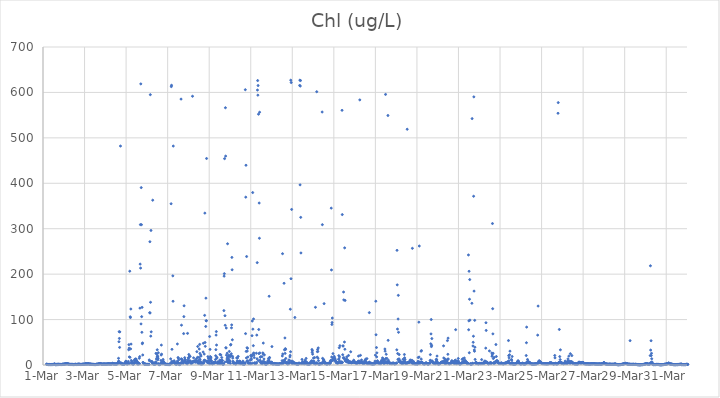
| Category | Chl (ug/L) |
|---|---|
| 44986.166666666664 | 1.69 |
| 44986.177083333336 | 1.74 |
| 44986.1875 | 1.43 |
| 44986.197916666664 | 1.4 |
| 44986.208333333336 | 1.3 |
| 44986.21875 | 1.14 |
| 44986.229166666664 | 1.26 |
| 44986.239583333336 | 1.11 |
| 44986.25 | 1.04 |
| 44986.260416666664 | 0.96 |
| 44986.270833333336 | 1.03 |
| 44986.28125 | 1.1 |
| 44986.291666666664 | 1.08 |
| 44986.302083333336 | 1.08 |
| 44986.3125 | 1.01 |
| 44986.322916666664 | 1.13 |
| 44986.333333333336 | 0.9 |
| 44986.34375 | 0.86 |
| 44986.354166666664 | 1.02 |
| 44986.364583333336 | 0.99 |
| 44986.375 | 0.85 |
| 44986.385416666664 | 0.95 |
| 44986.395833333336 | 1.22 |
| 44986.40625 | 1.03 |
| 44986.416666666664 | 0.92 |
| 44986.427083333336 | 1.09 |
| 44986.4375 | 1.03 |
| 44986.447916666664 | 0.97 |
| 44986.458333333336 | 1.02 |
| 44986.46875 | 1.23 |
| 44986.479166666664 | 1.21 |
| 44986.489583333336 | 0.96 |
| 44986.5 | 1.18 |
| 44986.510416666664 | 1.37 |
| 44986.520833333336 | 1.61 |
| 44986.53125 | 1.49 |
| 44986.541666666664 | 1.84 |
| 44986.552083333336 | 1.69 |
| 44986.5625 | 2.09 |
| 44986.572916666664 | 2.31 |
| 44986.583333333336 | 0.99 |
| 44986.59375 | 0.76 |
| 44986.604166666664 | 0.89 |
| 44986.614583333336 | 0.94 |
| 44986.625 | 0.81 |
| 44986.635416666664 | 0.73 |
| 44986.645833333336 | 0.79 |
| 44986.65625 | 1.16 |
| 44986.666666666664 | 1.66 |
| 44986.677083333336 | 0.84 |
| 44986.6875 | 0.89 |
| 44986.697916666664 | 0.98 |
| 44986.708333333336 | 1.47 |
| 44986.71875 | 1.92 |
| 44986.729166666664 | 1.52 |
| 44986.739583333336 | 1.25 |
| 44986.75 | 1.54 |
| 44986.760416666664 | 0.78 |
| 44986.770833333336 | 1.34 |
| 44986.78125 | 1.43 |
| 44986.791666666664 | 1.22 |
| 44986.802083333336 | 1.22 |
| 44986.8125 | 1.21 |
| 44986.822916666664 | 1.11 |
| 44986.833333333336 | 1.24 |
| 44986.84375 | 1.16 |
| 44986.854166666664 | 1.22 |
| 44986.864583333336 | 0.91 |
| 44986.875 | 1.33 |
| 44986.885416666664 | 1.12 |
| 44986.895833333336 | 1.16 |
| 44986.90625 | 0.96 |
| 44986.916666666664 | 1.14 |
| 44986.927083333336 | 1.21 |
| 44986.9375 | 1.52 |
| 44986.947916666664 | 1.69 |
| 44986.958333333336 | 1.68 |
| 44986.96875 | 1.69 |
| 44986.979166666664 | 1.68 |
| 44986.989583333336 | 1.74 |
| 44987.0 | 1.65 |
| 44987.010416666664 | 1.67 |
| 44987.020833333336 | 1.86 |
| 44987.03125 | 1.88 |
| 44987.041666666664 | 2.1 |
| 44987.052083333336 | 2.05 |
| 44987.0625 | 2.29 |
| 44987.072916666664 | 2.43 |
| 44987.083333333336 | 2.35 |
| 44987.09375 | 2.41 |
| 44987.104166666664 | 2.98 |
| 44987.114583333336 | 2.79 |
| 44987.125 | 2.88 |
| 44987.135416666664 | 2.73 |
| 44987.145833333336 | 2.21 |
| 44987.15625 | 2.87 |
| 44987.166666666664 | 2.99 |
| 44987.177083333336 | 2.99 |
| 44987.1875 | 2.67 |
| 44987.197916666664 | 2.53 |
| 44987.208333333336 | 2.46 |
| 44987.21875 | 1.86 |
| 44987.229166666664 | 1.7 |
| 44987.239583333336 | 1.77 |
| 44987.25 | 1.62 |
| 44987.260416666664 | 1.53 |
| 44987.270833333336 | 1.51 |
| 44987.28125 | 1.38 |
| 44987.291666666664 | 1.34 |
| 44987.302083333336 | 1.28 |
| 44987.3125 | 1.28 |
| 44987.322916666664 | 1.35 |
| 44987.333333333336 | 1.04 |
| 44987.34375 | 1.37 |
| 44987.354166666664 | 1.25 |
| 44987.364583333336 | 1.32 |
| 44987.375 | 1.31 |
| 44987.385416666664 | 1.2 |
| 44987.395833333336 | 1.33 |
| 44987.40625 | 1.01 |
| 44987.416666666664 | 1.22 |
| 44987.427083333336 | 1.42 |
| 44987.4375 | 1.06 |
| 44987.447916666664 | 1.08 |
| 44987.458333333336 | 1.06 |
| 44987.46875 | 0.98 |
| 44987.479166666664 | 1.07 |
| 44987.489583333336 | 1.11 |
| 44987.5 | 1.04 |
| 44987.510416666664 | 1.04 |
| 44987.520833333336 | 1.27 |
| 44987.53125 | 1.28 |
| 44987.541666666664 | 1.17 |
| 44987.552083333336 | 1.35 |
| 44987.5625 | 1.62 |
| 44987.572916666664 | 1.47 |
| 44987.583333333336 | 1.05 |
| 44987.59375 | 1.29 |
| 44987.604166666664 | 1.18 |
| 44987.614583333336 | 1.15 |
| 44987.625 | 1.04 |
| 44987.635416666664 | 1.19 |
| 44987.645833333336 | 1.63 |
| 44987.65625 | 1.56 |
| 44987.666666666664 | 1.22 |
| 44987.677083333336 | 1.07 |
| 44987.6875 | 1.19 |
| 44987.697916666664 | 1.73 |
| 44987.708333333336 | 1.73 |
| 44987.71875 | 1.62 |
| 44987.729166666664 | 1.6 |
| 44987.739583333336 | 1.73 |
| 44987.75 | 1.64 |
| 44987.760416666664 | 1.49 |
| 44987.770833333336 | 1.48 |
| 44987.78125 | 1.33 |
| 44987.791666666664 | 1.32 |
| 44987.802083333336 | 1.31 |
| 44987.8125 | 1.14 |
| 44987.822916666664 | 1.08 |
| 44987.833333333336 | 1.36 |
| 44987.84375 | 1.44 |
| 44987.854166666664 | 1.1 |
| 44987.864583333336 | 1.24 |
| 44987.875 | 1.45 |
| 44987.885416666664 | 1.43 |
| 44987.895833333336 | 1.51 |
| 44987.90625 | 1.67 |
| 44987.916666666664 | 1.6 |
| 44987.927083333336 | 1.43 |
| 44987.9375 | 1.62 |
| 44987.947916666664 | 1.79 |
| 44987.958333333336 | 1.98 |
| 44987.96875 | 1.55 |
| 44987.979166666664 | 1.65 |
| 44987.989583333336 | 1.64 |
| 44988.0 | 1.68 |
| 44988.010416666664 | 1.64 |
| 44988.020833333336 | 1.93 |
| 44988.03125 | 1.88 |
| 44988.041666666664 | 1.9 |
| 44988.052083333336 | 3.37 |
| 44988.0625 | 2.58 |
| 44988.072916666664 | 2.38 |
| 44988.083333333336 | 2.58 |
| 44988.09375 | 2.08 |
| 44988.104166666664 | 2.17 |
| 44988.114583333336 | 2.05 |
| 44988.125 | 2.23 |
| 44988.135416666664 | 2.37 |
| 44988.145833333336 | 2.31 |
| 44988.15625 | 2.35 |
| 44988.166666666664 | 2.82 |
| 44988.177083333336 | 2.87 |
| 44988.1875 | 3 |
| 44988.197916666664 | 2.35 |
| 44988.208333333336 | 2.21 |
| 44988.21875 | 2.03 |
| 44988.229166666664 | 1.95 |
| 44988.239583333336 | 1.89 |
| 44988.25 | 1.74 |
| 44988.260416666664 | 1.92 |
| 44988.270833333336 | 1.85 |
| 44988.28125 | 1.94 |
| 44988.291666666664 | 1.73 |
| 44988.302083333336 | 1.85 |
| 44988.3125 | 1.72 |
| 44988.322916666664 | 1.67 |
| 44988.333333333336 | 1.5 |
| 44988.34375 | 1.31 |
| 44988.354166666664 | 1.41 |
| 44988.364583333336 | 1.36 |
| 44988.375 | 1.42 |
| 44988.385416666664 | 1.41 |
| 44988.395833333336 | 1.31 |
| 44988.40625 | 1.45 |
| 44988.416666666664 | 1.28 |
| 44988.427083333336 | 1.47 |
| 44988.4375 | 1.11 |
| 44988.447916666664 | 1.07 |
| 44988.458333333336 | 1.08 |
| 44988.46875 | 0.98 |
| 44988.479166666664 | 1.2 |
| 44988.489583333336 | 1.09 |
| 44988.5 | 0.99 |
| 44988.510416666664 | 0.99 |
| 44988.520833333336 | 1.07 |
| 44988.53125 | 0.94 |
| 44988.541666666664 | 1.34 |
| 44988.552083333336 | 1.37 |
| 44988.5625 | 1.19 |
| 44988.572916666664 | 2.05 |
| 44988.583333333336 | 1.29 |
| 44988.59375 | 1.45 |
| 44988.604166666664 | 1.46 |
| 44988.614583333336 | 1.59 |
| 44988.625 | 1.62 |
| 44988.635416666664 | 1.78 |
| 44988.645833333336 | 1.84 |
| 44988.65625 | 1.96 |
| 44988.666666666664 | 2.11 |
| 44988.677083333336 | 2.39 |
| 44988.6875 | 2.29 |
| 44988.697916666664 | 2.4 |
| 44988.708333333336 | 2.47 |
| 44988.71875 | 2.56 |
| 44988.729166666664 | 2.76 |
| 44988.739583333336 | 2.9 |
| 44988.75 | 3.07 |
| 44988.760416666664 | 3.21 |
| 44988.770833333336 | 2.92 |
| 44988.78125 | 2.64 |
| 44988.791666666664 | 2.51 |
| 44988.802083333336 | 2.16 |
| 44988.8125 | 2.04 |
| 44988.822916666664 | 1.79 |
| 44988.833333333336 | 1.73 |
| 44988.84375 | 1.84 |
| 44988.854166666664 | 1.8 |
| 44988.864583333336 | 1.82 |
| 44988.875 | 1.65 |
| 44988.885416666664 | 1.98 |
| 44988.895833333336 | 1.95 |
| 44988.90625 | 2 |
| 44988.916666666664 | 2.03 |
| 44988.927083333336 | 2 |
| 44988.9375 | 2.12 |
| 44988.947916666664 | 2.05 |
| 44988.958333333336 | 2.09 |
| 44988.96875 | 2 |
| 44988.979166666664 | 2.04 |
| 44988.989583333336 | 1.9 |
| 44989.0 | 1.86 |
| 44989.010416666664 | 1.79 |
| 44989.020833333336 | 1.83 |
| 44989.03125 | 1.89 |
| 44989.041666666664 | 1.82 |
| 44989.052083333336 | 2.05 |
| 44989.0625 | 1.83 |
| 44989.072916666664 | 2.15 |
| 44989.083333333336 | 2.12 |
| 44989.09375 | 2.08 |
| 44989.104166666664 | 2.09 |
| 44989.114583333336 | 2.28 |
| 44989.125 | 2.57 |
| 44989.135416666664 | 2.38 |
| 44989.145833333336 | 2.43 |
| 44989.15625 | 2.37 |
| 44989.166666666664 | 2.8 |
| 44989.177083333336 | 2.42 |
| 44989.1875 | 2.4 |
| 44989.197916666664 | 2.19 |
| 44989.208333333336 | 2.18 |
| 44989.21875 | 2.04 |
| 44989.229166666664 | 2.51 |
| 44989.239583333336 | 2.3 |
| 44989.25 | 2.06 |
| 44989.260416666664 | 2.03 |
| 44989.270833333336 | 2.29 |
| 44989.28125 | 2.21 |
| 44989.291666666664 | 2.12 |
| 44989.302083333336 | 1.97 |
| 44989.3125 | 2.24 |
| 44989.322916666664 | 2.6 |
| 44989.333333333336 | 2.84 |
| 44989.34375 | 3.01 |
| 44989.354166666664 | 3.96 |
| 44989.364583333336 | 3.27 |
| 44989.375 | 2.56 |
| 44989.385416666664 | 2.48 |
| 44989.395833333336 | 2.4 |
| 44989.40625 | 2.72 |
| 44989.416666666664 | 2.22 |
| 44989.427083333336 | 2.34 |
| 44989.4375 | 2.39 |
| 44989.447916666664 | 2.51 |
| 44989.458333333336 | 2.31 |
| 44989.46875 | 2.14 |
| 44989.479166666664 | 2.08 |
| 44989.489583333336 | 2.13 |
| 44989.5 | 1.93 |
| 44989.510416666664 | 2.38 |
| 44989.520833333336 | 2.22 |
| 44989.53125 | 2.32 |
| 44989.541666666664 | 2.17 |
| 44989.552083333336 | 2.02 |
| 44989.5625 | 1.88 |
| 44989.572916666664 | 3.08 |
| 44989.583333333336 | 3.71 |
| 44989.59375 | 3.32 |
| 44989.604166666664 | 4.38 |
| 44989.614583333336 | 5.33 |
| 44989.625 | 6.44 |
| 44989.635416666664 | 14.7 |
| 44989.645833333336 | 8.84 |
| 44989.65625 | 51.25 |
| 44989.666666666664 | 73.38 |
| 44989.677083333336 | 58.46 |
| 44989.6875 | 38.7 |
| 44989.697916666664 | 72.84 |
| 44989.708333333336 | 3.96 |
| 44989.71875 | 3.85 |
| 44989.729166666664 | 481.94 |
| 44989.739583333336 | 4.78 |
| 44989.75 | 4.23 |
| 44989.760416666664 | 4.21 |
| 44989.770833333336 | 2.77 |
| 44989.78125 | 2.9 |
| 44989.791666666664 | 2.41 |
| 44989.802083333336 | 3.04 |
| 44989.8125 | 2.02 |
| 44989.822916666664 | 1.99 |
| 44989.833333333336 | 1.93 |
| 44989.84375 | 1.79 |
| 44989.854166666664 | 1.78 |
| 44989.864583333336 | 1.88 |
| 44989.875 | 1.69 |
| 44989.885416666664 | 1.62 |
| 44989.895833333336 | 1.79 |
| 44989.90625 | 1.9 |
| 44989.916666666664 | 1.84 |
| 44989.927083333336 | 2.4 |
| 44989.9375 | 3.34 |
| 44989.947916666664 | 3.91 |
| 44989.958333333336 | 3.68 |
| 44989.96875 | 5.8 |
| 44989.979166666664 | 7.62 |
| 44989.989583333336 | 8.38 |
| 44990.0 | 2.61 |
| 44990.010416666664 | 5.73 |
| 44990.020833333336 | 2.99 |
| 44990.03125 | 2.55 |
| 44990.041666666664 | 3.24 |
| 44990.052083333336 | 2.66 |
| 44990.0625 | 2.6 |
| 44990.072916666664 | 2.28 |
| 44990.083333333336 | 3.01 |
| 44990.09375 | 3.7 |
| 44990.104166666664 | 7.79 |
| 44990.114583333336 | 3.16 |
| 44990.125 | 33.53 |
| 44990.135416666664 | 44.79 |
| 44990.145833333336 | 37.09 |
| 44990.15625 | 17.83 |
| 44990.166666666664 | 3.25 |
| 44990.177083333336 | 206.48 |
| 44990.1875 | 16.83 |
| 44990.197916666664 | 106.09 |
| 44990.208333333336 | 104.43 |
| 44990.21875 | 35.45 |
| 44990.229166666664 | 123.23 |
| 44990.239583333336 | 46.03 |
| 44990.25 | 10.05 |
| 44990.260416666664 | 5.6 |
| 44990.270833333336 | 4.89 |
| 44990.28125 | 7.2 |
| 44990.291666666664 | 3.55 |
| 44990.302083333336 | 6.2 |
| 44990.3125 | 3.52 |
| 44990.322916666664 | 2.05 |
| 44990.333333333336 | 1.77 |
| 44990.34375 | 2.04 |
| 44990.354166666664 | 1.88 |
| 44990.364583333336 | 3.31 |
| 44990.375 | 3.33 |
| 44990.385416666664 | 10.06 |
| 44990.395833333336 | 4.83 |
| 44990.40625 | 5.02 |
| 44990.416666666664 | 4.84 |
| 44990.427083333336 | 12.58 |
| 44990.4375 | 9.54 |
| 44990.447916666664 | 9.62 |
| 44990.458333333336 | 13.48 |
| 44990.46875 | 11.82 |
| 44990.479166666664 | 12.86 |
| 44990.489583333336 | 9.41 |
| 44990.5 | 9.17 |
| 44990.510416666664 | 7.58 |
| 44990.520833333336 | 7.54 |
| 44990.53125 | 7.17 |
| 44990.541666666664 | 6.37 |
| 44990.552083333336 | 2.01 |
| 44990.5625 | 3 |
| 44990.572916666664 | 3.55 |
| 44990.583333333336 | 2.92 |
| 44990.59375 | 2.01 |
| 44990.604166666664 | 3.56 |
| 44990.614583333336 | 2.87 |
| 44990.625 | 2.89 |
| 44990.635416666664 | 14.85 |
| 44990.645833333336 | 2.95 |
| 44990.65625 | 18.49 |
| 44990.666666666664 | 125.18 |
| 44990.677083333336 | 222.08 |
| 44990.6875 | 309.01 |
| 44990.697916666664 | 213.34 |
| 44990.708333333336 | 618.78 |
| 44990.71875 | 90.41 |
| 44990.729166666664 | 390.46 |
| 44990.739583333336 | 308.9 |
| 44990.75 | 106.39 |
| 44990.760416666664 | 71.98 |
| 44990.770833333336 | 126.9 |
| 44990.78125 | 46.82 |
| 44990.791666666664 | 48.6 |
| 44990.802083333336 | 22.08 |
| 44990.8125 | 5.78 |
| 44990.822916666664 | 4.71 |
| 44990.833333333336 | 4.82 |
| 44990.84375 | 3.48 |
| 44990.854166666664 | 3.35 |
| 44990.864583333336 | 2.79 |
| 44990.875 | 2.03 |
| 44990.885416666664 | 1.52 |
| 44990.895833333336 | 1.9 |
| 44990.90625 | 2.65 |
| 44990.916666666664 | 1.52 |
| 44990.927083333336 | 1.7 |
| 44990.9375 | 1.55 |
| 44990.947916666664 | 1.54 |
| 44990.958333333336 | 1.37 |
| 44990.96875 | 1.26 |
| 44990.979166666664 | 1.25 |
| 44990.989583333336 | 1.18 |
| 44991.0 | 1.48 |
| 44991.010416666664 | 1.15 |
| 44991.020833333336 | 1.33 |
| 44991.03125 | 1.26 |
| 44991.041666666664 | 1.26 |
| 44991.052083333336 | 1.46 |
| 44991.0625 | 1.32 |
| 44991.072916666664 | 1.22 |
| 44991.083333333336 | 1.12 |
| 44991.09375 | 1.4 |
| 44991.104166666664 | 1.4 |
| 44991.114583333336 | 11.15 |
| 44991.125 | 9.31 |
| 44991.135416666664 | 115.13 |
| 44991.145833333336 | 271.39 |
| 44991.15625 | 114.54 |
| 44991.166666666664 | 595.06 |
| 44991.177083333336 | 138.02 |
| 44991.1875 | 63.56 |
| 44991.197916666664 | 296.2 |
| 44991.208333333336 | 73.01 |
| 44991.21875 | 7.69 |
| 44991.229166666664 | 6.73 |
| 44991.239583333336 | 6.89 |
| 44991.25 | 7.01 |
| 44991.260416666664 | 6.5 |
| 44991.270833333336 | 3.22 |
| 44991.28125 | 362.8 |
| 44991.291666666664 | 2.77 |
| 44991.302083333336 | 2.77 |
| 44991.3125 | 2.64 |
| 44991.322916666664 | 2.6 |
| 44991.333333333336 | 2.27 |
| 44991.34375 | 2.18 |
| 44991.354166666664 | 1.91 |
| 44991.364583333336 | 1.54 |
| 44991.375 | 4.45 |
| 44991.385416666664 | 2.14 |
| 44991.395833333336 | 1.38 |
| 44991.40625 | 2.61 |
| 44991.416666666664 | 4.9 |
| 44991.427083333336 | 6.69 |
| 44991.4375 | 25.63 |
| 44991.447916666664 | 4.51 |
| 44991.458333333336 | 13.2 |
| 44991.46875 | 3.34 |
| 44991.479166666664 | 24.28 |
| 44991.489583333336 | 17.55 |
| 44991.5 | 33.47 |
| 44991.510416666664 | 19.85 |
| 44991.520833333336 | 11.34 |
| 44991.53125 | 17.69 |
| 44991.541666666664 | 13.88 |
| 44991.552083333336 | 26.83 |
| 44991.5625 | 3 |
| 44991.572916666664 | 0.95 |
| 44991.583333333336 | 0.84 |
| 44991.59375 | 0.96 |
| 44991.604166666664 | 0.97 |
| 44991.614583333336 | 0.94 |
| 44991.625 | 0.97 |
| 44991.635416666664 | 2.05 |
| 44991.645833333336 | 2.79 |
| 44991.65625 | 2.38 |
| 44991.666666666664 | 3.08 |
| 44991.677083333336 | 9.9 |
| 44991.6875 | 21.99 |
| 44991.697916666664 | 43.86 |
| 44991.708333333336 | 23.88 |
| 44991.71875 | 4.63 |
| 44991.729166666664 | 3.62 |
| 44991.739583333336 | 7.26 |
| 44991.75 | 6.08 |
| 44991.760416666664 | 3.13 |
| 44991.770833333336 | 3.39 |
| 44991.78125 | 12.2 |
| 44991.791666666664 | 7.46 |
| 44991.802083333336 | 7.74 |
| 44991.8125 | 4.07 |
| 44991.822916666664 | 4.5 |
| 44991.833333333336 | 3.56 |
| 44991.84375 | 3.21 |
| 44991.854166666664 | 2.36 |
| 44991.864583333336 | 2.81 |
| 44991.875 | 2.43 |
| 44991.885416666664 | 2 |
| 44991.895833333336 | 1.7 |
| 44991.90625 | 1.76 |
| 44991.916666666664 | 1.5 |
| 44991.927083333336 | 1.52 |
| 44991.9375 | 1.42 |
| 44991.947916666664 | 1.35 |
| 44991.958333333336 | 1.25 |
| 44991.96875 | 1.37 |
| 44991.979166666664 | 1.38 |
| 44991.989583333336 | 1.19 |
| 44992.0 | 1.16 |
| 44992.010416666664 | 1.04 |
| 44992.020833333336 | 1.17 |
| 44992.03125 | 1.24 |
| 44992.041666666664 | 1.12 |
| 44992.052083333336 | 0.98 |
| 44992.0625 | 0.86 |
| 44992.072916666664 | 0.75 |
| 44992.083333333336 | 1.27 |
| 44992.09375 | 1.02 |
| 44992.104166666664 | 1.14 |
| 44992.114583333336 | 1.87 |
| 44992.125 | 3.51 |
| 44992.135416666664 | 2.13 |
| 44992.145833333336 | 13.52 |
| 44992.15625 | 2.76 |
| 44992.166666666664 | 354.96 |
| 44992.177083333336 | 612.76 |
| 44992.1875 | 615.73 |
| 44992.197916666664 | 7.99 |
| 44992.208333333336 | 34.51 |
| 44992.21875 | 5.36 |
| 44992.229166666664 | 4.43 |
| 44992.239583333336 | 6.67 |
| 44992.25 | 196.22 |
| 44992.260416666664 | 140.31 |
| 44992.270833333336 | 481.93 |
| 44992.28125 | 6.77 |
| 44992.291666666664 | 6.75 |
| 44992.302083333336 | 6.55 |
| 44992.3125 | 9.36 |
| 44992.322916666664 | 6.43 |
| 44992.333333333336 | 5.73 |
| 44992.34375 | 4.31 |
| 44992.354166666664 | 3.68 |
| 44992.364583333336 | 2.99 |
| 44992.375 | 2.53 |
| 44992.385416666664 | 3.04 |
| 44992.395833333336 | 2.1 |
| 44992.40625 | 1.7 |
| 44992.416666666664 | 1.85 |
| 44992.427083333336 | 1.63 |
| 44992.4375 | 3.94 |
| 44992.447916666664 | 1.79 |
| 44992.458333333336 | 8 |
| 44992.46875 | 46.27 |
| 44992.479166666664 | 4.7 |
| 44992.489583333336 | 5.35 |
| 44992.5 | 16.36 |
| 44992.510416666664 | 4.99 |
| 44992.520833333336 | 14.95 |
| 44992.53125 | 11.15 |
| 44992.541666666664 | 3 |
| 44992.552083333336 | 1.08 |
| 44992.5625 | 1.19 |
| 44992.572916666664 | 0.98 |
| 44992.583333333336 | 0.93 |
| 44992.59375 | 1.58 |
| 44992.604166666664 | 2.08 |
| 44992.614583333336 | 3.61 |
| 44992.625 | 3.44 |
| 44992.635416666664 | 4.39 |
| 44992.645833333336 | 585.32 |
| 44992.65625 | 13.55 |
| 44992.666666666664 | 87.69 |
| 44992.677083333336 | 11.54 |
| 44992.6875 | 12.86 |
| 44992.697916666664 | 6.55 |
| 44992.708333333336 | 9.32 |
| 44992.71875 | 4.51 |
| 44992.729166666664 | 5.33 |
| 44992.739583333336 | 5.88 |
| 44992.75 | 3.93 |
| 44992.760416666664 | 4.92 |
| 44992.770833333336 | 69.12 |
| 44992.78125 | 106.53 |
| 44992.791666666664 | 130.3 |
| 44992.802083333336 | 7.19 |
| 44992.8125 | 9.96 |
| 44992.822916666664 | 16.14 |
| 44992.833333333336 | 12.38 |
| 44992.84375 | 10.66 |
| 44992.854166666664 | 10.94 |
| 44992.864583333336 | 6.71 |
| 44992.875 | 6.01 |
| 44992.885416666664 | 5.71 |
| 44992.895833333336 | 4.74 |
| 44992.90625 | 3.76 |
| 44992.916666666664 | 3.18 |
| 44992.927083333336 | 2.95 |
| 44992.9375 | 2.79 |
| 44992.947916666664 | 2.69 |
| 44992.958333333336 | 69.61 |
| 44992.96875 | 7.68 |
| 44992.979166666664 | 11.15 |
| 44992.989583333336 | 5.77 |
| 44993.0 | 15.53 |
| 44993.010416666664 | 15.67 |
| 44993.020833333336 | 23.15 |
| 44993.03125 | 7.32 |
| 44993.041666666664 | 19.53 |
| 44993.052083333336 | 8.75 |
| 44993.0625 | 8.77 |
| 44993.072916666664 | 7.21 |
| 44993.083333333336 | 18.94 |
| 44993.09375 | 8.91 |
| 44993.104166666664 | 4.9 |
| 44993.114583333336 | 4.41 |
| 44993.125 | 4.06 |
| 44993.135416666664 | 5.4 |
| 44993.145833333336 | 3.52 |
| 44993.15625 | 6.26 |
| 44993.166666666664 | 3.94 |
| 44993.177083333336 | 5.64 |
| 44993.1875 | 5.32 |
| 44993.197916666664 | 591.57 |
| 44993.208333333336 | 6.25 |
| 44993.21875 | 6.86 |
| 44993.229166666664 | 8.18 |
| 44993.239583333336 | 7.14 |
| 44993.25 | 15.74 |
| 44993.260416666664 | 7.27 |
| 44993.270833333336 | 7.84 |
| 44993.28125 | 6.87 |
| 44993.291666666664 | 8.15 |
| 44993.302083333336 | 9.16 |
| 44993.3125 | 7.76 |
| 44993.322916666664 | 8.94 |
| 44993.333333333336 | 9.23 |
| 44993.34375 | 6.11 |
| 44993.354166666664 | 7.96 |
| 44993.364583333336 | 7.13 |
| 44993.375 | 7.4 |
| 44993.385416666664 | 13.61 |
| 44993.395833333336 | 9 |
| 44993.40625 | 29.33 |
| 44993.416666666664 | 8.38 |
| 44993.427083333336 | 6.02 |
| 44993.4375 | 16.87 |
| 44993.447916666664 | 40.8 |
| 44993.458333333336 | 6.79 |
| 44993.46875 | 3.62 |
| 44993.479166666664 | 4.54 |
| 44993.489583333336 | 10.3 |
| 44993.5 | 3.23 |
| 44993.510416666664 | 16.68 |
| 44993.520833333336 | 35.16 |
| 44993.53125 | 6.46 |
| 44993.541666666664 | 45.37 |
| 44993.552083333336 | 25.39 |
| 44993.5625 | 12.4 |
| 44993.572916666664 | 1.99 |
| 44993.583333333336 | 7.51 |
| 44993.59375 | 21.81 |
| 44993.604166666664 | 19.57 |
| 44993.614583333336 | 4.21 |
| 44993.625 | 3.53 |
| 44993.635416666664 | 1.75 |
| 44993.645833333336 | 3.43 |
| 44993.65625 | 4.35 |
| 44993.666666666664 | 2.3 |
| 44993.677083333336 | 3.3 |
| 44993.6875 | 3.32 |
| 44993.697916666664 | 4.31 |
| 44993.708333333336 | 28.6 |
| 44993.71875 | 47.78 |
| 44993.729166666664 | 6.34 |
| 44993.739583333336 | 4.39 |
| 44993.75 | 9.68 |
| 44993.760416666664 | 24.09 |
| 44993.770833333336 | 10.61 |
| 44993.78125 | 109.27 |
| 44993.791666666664 | 334.34 |
| 44993.802083333336 | 49.54 |
| 44993.8125 | 41.08 |
| 44993.822916666664 | 9.63 |
| 44993.833333333336 | 84.85 |
| 44993.84375 | 147.17 |
| 44993.854166666664 | 97.48 |
| 44993.864583333336 | 97.35 |
| 44993.875 | 454.58 |
| 44993.885416666664 | 7.46 |
| 44993.895833333336 | 6.8 |
| 44993.90625 | 6.09 |
| 44993.916666666664 | 9.05 |
| 44993.927083333336 | 5.45 |
| 44993.9375 | 18.37 |
| 44993.947916666664 | 5.61 |
| 44993.958333333336 | 7.15 |
| 44993.96875 | 14.73 |
| 44993.979166666664 | 4.28 |
| 44993.989583333336 | 14.25 |
| 44994.0 | 4.51 |
| 44994.010416666664 | 9.18 |
| 44994.020833333336 | 62.72 |
| 44994.03125 | 2.5 |
| 44994.041666666664 | 34.36 |
| 44994.052083333336 | 18.53 |
| 44994.0625 | 9.3 |
| 44994.072916666664 | 14.42 |
| 44994.083333333336 | 17.11 |
| 44994.09375 | 10.01 |
| 44994.104166666664 | 9.13 |
| 44994.114583333336 | 6.48 |
| 44994.125 | 3.4 |
| 44994.135416666664 | 3.39 |
| 44994.145833333336 | 2.63 |
| 44994.15625 | 2.81 |
| 44994.166666666664 | 2.82 |
| 44994.177083333336 | 3.4 |
| 44994.1875 | 3.6 |
| 44994.197916666664 | 3.35 |
| 44994.208333333336 | 4.89 |
| 44994.21875 | 5.6 |
| 44994.229166666664 | 5.5 |
| 44994.239583333336 | 4.28 |
| 44994.25 | 4.06 |
| 44994.260416666664 | 5.36 |
| 44994.270833333336 | 5.78 |
| 44994.28125 | 5.78 |
| 44994.291666666664 | 6.64 |
| 44994.302083333336 | 12.05 |
| 44994.3125 | 20.41 |
| 44994.322916666664 | 33.78 |
| 44994.333333333336 | 65.84 |
| 44994.34375 | 73.59 |
| 44994.354166666664 | 43.94 |
| 44994.364583333336 | 14.88 |
| 44994.375 | 16.79 |
| 44994.385416666664 | 5.04 |
| 44994.395833333336 | 4.15 |
| 44994.40625 | 3.22 |
| 44994.416666666664 | 5.98 |
| 44994.427083333336 | 7.3 |
| 44994.4375 | 5.37 |
| 44994.447916666664 | 4.92 |
| 44994.458333333336 | 6.01 |
| 44994.46875 | 4.57 |
| 44994.479166666664 | 3.16 |
| 44994.489583333336 | 3.62 |
| 44994.5 | 7.33 |
| 44994.510416666664 | 10.76 |
| 44994.520833333336 | 23.36 |
| 44994.53125 | 2.89 |
| 44994.541666666664 | 8.81 |
| 44994.552083333336 | 8.37 |
| 44994.5625 | 22.09 |
| 44994.572916666664 | 9.99 |
| 44994.583333333336 | 7.68 |
| 44994.59375 | 7.81 |
| 44994.604166666664 | 16.38 |
| 44994.614583333336 | 4.11 |
| 44994.625 | 10.35 |
| 44994.635416666664 | 9.61 |
| 44994.645833333336 | 2.18 |
| 44994.65625 | 1.81 |
| 44994.666666666664 | 1.82 |
| 44994.677083333336 | 1.8 |
| 44994.6875 | 1.77 |
| 44994.697916666664 | 1.94 |
| 44994.708333333336 | 119.76 |
| 44994.71875 | 195.58 |
| 44994.729166666664 | 201.06 |
| 44994.739583333336 | 454.23 |
| 44994.75 | 6.37 |
| 44994.760416666664 | 108.53 |
| 44994.770833333336 | 87.39 |
| 44994.78125 | 566.29 |
| 44994.791666666664 | 459.82 |
| 44994.802083333336 | 38.04 |
| 44994.8125 | 37.5 |
| 44994.822916666664 | 81.43 |
| 44994.833333333336 | 21.7 |
| 44994.84375 | 8.28 |
| 44994.854166666664 | 13.14 |
| 44994.864583333336 | 25.95 |
| 44994.875 | 17.05 |
| 44994.885416666664 | 266.88 |
| 44994.895833333336 | 5.79 |
| 44994.90625 | 6.18 |
| 44994.916666666664 | 11.15 |
| 44994.927083333336 | 13.49 |
| 44994.9375 | 19.45 |
| 44994.947916666664 | 21.42 |
| 44994.958333333336 | 4.73 |
| 44994.96875 | 29.89 |
| 44994.979166666664 | 6.32 |
| 44994.989583333336 | 9.68 |
| 44995.0 | 7.66 |
| 44995.010416666664 | 17.9 |
| 44995.020833333336 | 3.62 |
| 44995.03125 | 44.08 |
| 44995.041666666664 | 45.14 |
| 44995.052083333336 | 21.05 |
| 44995.0625 | 24.68 |
| 44995.072916666664 | 81.77 |
| 44995.083333333336 | 88.29 |
| 44995.09375 | 236.83 |
| 44995.104166666664 | 209.6 |
| 44995.114583333336 | 55.47 |
| 44995.125 | 18.9 |
| 44995.135416666664 | 15.12 |
| 44995.145833333336 | 8.08 |
| 44995.15625 | 6.48 |
| 44995.166666666664 | 5.15 |
| 44995.177083333336 | 3.93 |
| 44995.1875 | 3.44 |
| 44995.197916666664 | 4.1 |
| 44995.208333333336 | 3.31 |
| 44995.21875 | 3.74 |
| 44995.229166666664 | 3.95 |
| 44995.239583333336 | 3.13 |
| 44995.25 | 3.59 |
| 44995.260416666664 | 3.73 |
| 44995.270833333336 | 2.12 |
| 44995.28125 | 2.17 |
| 44995.291666666664 | 2.92 |
| 44995.302083333336 | 2.87 |
| 44995.3125 | 4.72 |
| 44995.322916666664 | 15.6 |
| 44995.333333333336 | 4.51 |
| 44995.34375 | 6.29 |
| 44995.354166666664 | 9.16 |
| 44995.364583333336 | 15.47 |
| 44995.375 | 6.43 |
| 44995.385416666664 | 5.65 |
| 44995.395833333336 | 19.02 |
| 44995.40625 | 6.99 |
| 44995.416666666664 | 6.01 |
| 44995.427083333336 | 4.14 |
| 44995.4375 | 4.17 |
| 44995.447916666664 | 5.14 |
| 44995.458333333336 | 7.14 |
| 44995.46875 | 8.61 |
| 44995.479166666664 | 6.43 |
| 44995.489583333336 | 7.26 |
| 44995.5 | 3.46 |
| 44995.510416666664 | 3.03 |
| 44995.520833333336 | 3.02 |
| 44995.53125 | 2.96 |
| 44995.541666666664 | 3.58 |
| 44995.552083333336 | 4.19 |
| 44995.5625 | 3.34 |
| 44995.572916666664 | 3.34 |
| 44995.583333333336 | 4.68 |
| 44995.59375 | 3.26 |
| 44995.604166666664 | 3.9 |
| 44995.614583333336 | 1.75 |
| 44995.625 | 8.5 |
| 44995.635416666664 | 5.78 |
| 44995.645833333336 | 2.11 |
| 44995.65625 | 1.91 |
| 44995.666666666664 | 2.17 |
| 44995.677083333336 | 1.79 |
| 44995.6875 | 1.86 |
| 44995.697916666664 | 1.82 |
| 44995.708333333336 | 2.94 |
| 44995.71875 | 4.62 |
| 44995.729166666664 | 4.3 |
| 44995.739583333336 | 605.98 |
| 44995.75 | 69.08 |
| 44995.760416666664 | 369.47 |
| 44995.770833333336 | 439.71 |
| 44995.78125 | 29.95 |
| 44995.791666666664 | 15.57 |
| 44995.802083333336 | 238.8 |
| 44995.8125 | 8.39 |
| 44995.822916666664 | 38.06 |
| 44995.833333333336 | 30.57 |
| 44995.84375 | 36.64 |
| 44995.854166666664 | 9.42 |
| 44995.864583333336 | 17.65 |
| 44995.875 | 5.89 |
| 44995.885416666664 | 3.72 |
| 44995.895833333336 | 3.9 |
| 44995.90625 | 4.59 |
| 44995.916666666664 | 3.23 |
| 44995.927083333336 | 3.59 |
| 44995.9375 | 3.44 |
| 44995.947916666664 | 3.86 |
| 44995.958333333336 | 3.33 |
| 44995.96875 | 10.59 |
| 44995.979166666664 | 3.73 |
| 44995.989583333336 | 2.97 |
| 44996.0 | 20.84 |
| 44996.010416666664 | 2.69 |
| 44996.020833333336 | 14.22 |
| 44996.03125 | 11.66 |
| 44996.041666666664 | 19.4 |
| 44996.052083333336 | 21.18 |
| 44996.0625 | 64.55 |
| 44996.072916666664 | 96.75 |
| 44996.083333333336 | 4.02 |
| 44996.09375 | 379.57 |
| 44996.104166666664 | 78.93 |
| 44996.114583333336 | 24.47 |
| 44996.125 | 42.56 |
| 44996.135416666664 | 101.37 |
| 44996.145833333336 | 26.5 |
| 44996.15625 | 21.91 |
| 44996.166666666664 | 16.43 |
| 44996.177083333336 | 4.78 |
| 44996.1875 | 3.66 |
| 44996.197916666664 | 3.15 |
| 44996.208333333336 | 3.42 |
| 44996.21875 | 3 |
| 44996.229166666664 | 3.32 |
| 44996.239583333336 | 4.03 |
| 44996.25 | 4.09 |
| 44996.260416666664 | 3.84 |
| 44996.270833333336 | 25.96 |
| 44996.28125 | 5.34 |
| 44996.291666666664 | 65.81 |
| 44996.302083333336 | 13.79 |
| 44996.3125 | 225.31 |
| 44996.322916666664 | 605.23 |
| 44996.333333333336 | 626.11 |
| 44996.34375 | 593.98 |
| 44996.354166666664 | 615.15 |
| 44996.364583333336 | 9.46 |
| 44996.375 | 552.11 |
| 44996.385416666664 | 78.16 |
| 44996.395833333336 | 25.06 |
| 44996.40625 | 356.55 |
| 44996.416666666664 | 278.98 |
| 44996.427083333336 | 556.39 |
| 44996.4375 | 26.69 |
| 44996.447916666664 | 10.39 |
| 44996.458333333336 | 16.97 |
| 44996.46875 | 6.14 |
| 44996.479166666664 | 18.14 |
| 44996.489583333336 | 5.56 |
| 44996.5 | 3.99 |
| 44996.510416666664 | 6.75 |
| 44996.520833333336 | 3.29 |
| 44996.53125 | 3.44 |
| 44996.541666666664 | 18.42 |
| 44996.552083333336 | 2.89 |
| 44996.5625 | 3.17 |
| 44996.572916666664 | 7.52 |
| 44996.583333333336 | 26.61 |
| 44996.59375 | 24.34 |
| 44996.604166666664 | 48.23 |
| 44996.614583333336 | 6.7 |
| 44996.625 | 7 |
| 44996.635416666664 | 13.29 |
| 44996.645833333336 | 6.88 |
| 44996.65625 | 22.23 |
| 44996.666666666664 | 6.1 |
| 44996.677083333336 | 5.56 |
| 44996.6875 | 2.13 |
| 44996.697916666664 | 2.93 |
| 44996.708333333336 | 1.68 |
| 44996.71875 | 1.51 |
| 44996.729166666664 | 1.67 |
| 44996.739583333336 | 1.87 |
| 44996.75 | 1.7 |
| 44996.760416666664 | 1.75 |
| 44996.770833333336 | 2.15 |
| 44996.78125 | 5.5 |
| 44996.791666666664 | 3.44 |
| 44996.802083333336 | 3.38 |
| 44996.8125 | 3.49 |
| 44996.822916666664 | 6.22 |
| 44996.833333333336 | 9.28 |
| 44996.84375 | 8.91 |
| 44996.854166666664 | 14.23 |
| 44996.864583333336 | 7.2 |
| 44996.875 | 11.04 |
| 44996.885416666664 | 151.35 |
| 44996.895833333336 | 15.6 |
| 44996.90625 | 16.55 |
| 44996.916666666664 | 6.86 |
| 44996.927083333336 | 6.08 |
| 44996.9375 | 5.3 |
| 44996.947916666664 | 4.87 |
| 44996.958333333336 | 4.36 |
| 44996.96875 | 6.14 |
| 44996.979166666664 | 3.72 |
| 44996.989583333336 | 4.63 |
| 44997.0 | 4.47 |
| 44997.010416666664 | 6.41 |
| 44997.020833333336 | 40.53 |
| 44997.03125 | 2.86 |
| 44997.041666666664 | 4.14 |
| 44997.052083333336 | 2.38 |
| 44997.0625 | 2.68 |
| 44997.072916666664 | 2.69 |
| 44997.083333333336 | 2.85 |
| 44997.09375 | 2.55 |
| 44997.104166666664 | 2.56 |
| 44997.114583333336 | 3.01 |
| 44997.125 | 2.66 |
| 44997.135416666664 | 2.88 |
| 44997.145833333336 | 3.06 |
| 44997.15625 | 3.44 |
| 44997.166666666664 | 2.4 |
| 44997.177083333336 | 2.62 |
| 44997.1875 | 2.57 |
| 44997.197916666664 | 2.51 |
| 44997.208333333336 | 2.58 |
| 44997.21875 | 2.25 |
| 44997.229166666664 | 2.11 |
| 44997.239583333336 | 2.28 |
| 44997.25 | 2.25 |
| 44997.260416666664 | 2.14 |
| 44997.270833333336 | 1.96 |
| 44997.28125 | 2.21 |
| 44997.291666666664 | 2.01 |
| 44997.302083333336 | 2.16 |
| 44997.3125 | 1.83 |
| 44997.322916666664 | 1.92 |
| 44997.333333333336 | 1.9 |
| 44997.34375 | 1.97 |
| 44997.354166666664 | 2.03 |
| 44997.364583333336 | 2.2 |
| 44997.375 | 2.38 |
| 44997.385416666664 | 2.59 |
| 44997.395833333336 | 2.65 |
| 44997.40625 | 2.97 |
| 44997.416666666664 | 3.5 |
| 44997.427083333336 | 3.1 |
| 44997.4375 | 3.24 |
| 44997.447916666664 | 3.22 |
| 44997.458333333336 | 3.29 |
| 44997.46875 | 3.61 |
| 44997.479166666664 | 3.96 |
| 44997.489583333336 | 2.83 |
| 44997.5 | 3.37 |
| 44997.510416666664 | 9.52 |
| 44997.520833333336 | 19.92 |
| 44997.53125 | 245.04 |
| 44997.541666666664 | 24.29 |
| 44997.552083333336 | 3.8 |
| 44997.5625 | 9.07 |
| 44997.572916666664 | 4.21 |
| 44997.583333333336 | 5.3 |
| 44997.59375 | 9.33 |
| 44997.604166666664 | 179.89 |
| 44997.614583333336 | 8.09 |
| 44997.625 | 33.45 |
| 44997.635416666664 | 10.92 |
| 44997.645833333336 | 59.52 |
| 44997.65625 | 25.49 |
| 44997.666666666664 | 36 |
| 44997.677083333336 | 34.25 |
| 44997.6875 | 14.5 |
| 44997.697916666664 | 5.54 |
| 44997.708333333336 | 5.04 |
| 44997.71875 | 4.3 |
| 44997.729166666664 | 3.94 |
| 44997.739583333336 | 3.71 |
| 44997.75 | 2.92 |
| 44997.760416666664 | 2.65 |
| 44997.770833333336 | 6.07 |
| 44997.78125 | 2.45 |
| 44997.791666666664 | 2.37 |
| 44997.802083333336 | 2.58 |
| 44997.8125 | 4.23 |
| 44997.822916666664 | 4.39 |
| 44997.833333333336 | 10.91 |
| 44997.84375 | 4.22 |
| 44997.854166666664 | 4.67 |
| 44997.864583333336 | 4.75 |
| 44997.875 | 9.72 |
| 44997.885416666664 | 17.83 |
| 44997.895833333336 | 21.08 |
| 44997.90625 | 122.78 |
| 44997.916666666664 | 29.2 |
| 44997.927083333336 | 626.95 |
| 44997.9375 | 189.94 |
| 44997.947916666664 | 621.72 |
| 44997.958333333336 | 8.18 |
| 44997.96875 | 342.43 |
| 44997.979166666664 | 5.51 |
| 44997.989583333336 | 4.02 |
| 44998.0 | 3.14 |
| 44998.010416666664 | 8.14 |
| 44998.020833333336 | 5.69 |
| 44998.03125 | 4.81 |
| 44998.041666666664 | 6.03 |
| 44998.052083333336 | 5.78 |
| 44998.0625 | 4.13 |
| 44998.072916666664 | 4.78 |
| 44998.083333333336 | 4.07 |
| 44998.09375 | 4.1 |
| 44998.104166666664 | 4.02 |
| 44998.114583333336 | 4 |
| 44998.125 | 104.62 |
| 44998.135416666664 | 3.78 |
| 44998.145833333336 | 3.33 |
| 44998.15625 | 3.21 |
| 44998.166666666664 | 3.26 |
| 44998.177083333336 | 3.24 |
| 44998.1875 | 2.29 |
| 44998.197916666664 | 2.3 |
| 44998.208333333336 | 2.33 |
| 44998.21875 | 2.18 |
| 44998.229166666664 | 2.33 |
| 44998.239583333336 | 2.44 |
| 44998.25 | 1.73 |
| 44998.260416666664 | 1.93 |
| 44998.270833333336 | 1.89 |
| 44998.28125 | 1.87 |
| 44998.291666666664 | 2.15 |
| 44998.302083333336 | 2.46 |
| 44998.3125 | 4.08 |
| 44998.322916666664 | 3.6 |
| 44998.333333333336 | 3.24 |
| 44998.34375 | 3.97 |
| 44998.354166666664 | 615.32 |
| 44998.364583333336 | 626.99 |
| 44998.375 | 396.54 |
| 44998.385416666664 | 614.01 |
| 44998.395833333336 | 626.14 |
| 44998.40625 | 324.97 |
| 44998.416666666664 | 246.64 |
| 44998.427083333336 | 3.18 |
| 44998.4375 | 3.29 |
| 44998.447916666664 | 3.53 |
| 44998.458333333336 | 4.64 |
| 44998.46875 | 12.25 |
| 44998.479166666664 | 3.96 |
| 44998.489583333336 | 3.66 |
| 44998.5 | 7.16 |
| 44998.510416666664 | 5.25 |
| 44998.520833333336 | 3.92 |
| 44998.53125 | 3.75 |
| 44998.541666666664 | 3.22 |
| 44998.552083333336 | 3.37 |
| 44998.5625 | 3.14 |
| 44998.572916666664 | 3.16 |
| 44998.583333333336 | 3.13 |
| 44998.59375 | 2.83 |
| 44998.604166666664 | 4.8 |
| 44998.614583333336 | 10.31 |
| 44998.625 | 6.54 |
| 44998.635416666664 | 4.72 |
| 44998.645833333336 | 4.96 |
| 44998.65625 | 6.93 |
| 44998.666666666664 | 14.43 |
| 44998.677083333336 | 3.4 |
| 44998.6875 | 6.46 |
| 44998.697916666664 | 2.01 |
| 44998.708333333336 | 3.6 |
| 44998.71875 | 2.95 |
| 44998.729166666664 | 2.34 |
| 44998.739583333336 | 2.14 |
| 44998.75 | 2.32 |
| 44998.760416666664 | 3.04 |
| 44998.770833333336 | 1.98 |
| 44998.78125 | 2.13 |
| 44998.791666666664 | 2.06 |
| 44998.802083333336 | 2.02 |
| 44998.8125 | 2.14 |
| 44998.822916666664 | 2.09 |
| 44998.833333333336 | 2.31 |
| 44998.84375 | 2.45 |
| 44998.854166666664 | 2.43 |
| 44998.864583333336 | 3.03 |
| 44998.875 | 5.08 |
| 44998.885416666664 | 7.11 |
| 44998.895833333336 | 4.69 |
| 44998.90625 | 4.57 |
| 44998.916666666664 | 5.32 |
| 44998.927083333336 | 5.35 |
| 44998.9375 | 9.52 |
| 44998.947916666664 | 34.01 |
| 44998.958333333336 | 27.83 |
| 44998.96875 | 31.5 |
| 44998.979166666664 | 23.81 |
| 44998.989583333336 | 7.93 |
| 44999.0 | 8 |
| 44999.010416666664 | 4.53 |
| 44999.020833333336 | 15.23 |
| 44999.03125 | 4.48 |
| 44999.041666666664 | 8.43 |
| 44999.052083333336 | 6.08 |
| 44999.0625 | 3.6 |
| 44999.072916666664 | 16.32 |
| 44999.083333333336 | 3.19 |
| 44999.09375 | 2.58 |
| 44999.104166666664 | 2.62 |
| 44999.114583333336 | 126.97 |
| 44999.125 | 2.71 |
| 44999.135416666664 | 2.88 |
| 44999.145833333336 | 4.51 |
| 44999.15625 | 3.79 |
| 44999.166666666664 | 4.37 |
| 44999.177083333336 | 601.59 |
| 44999.1875 | 3.56 |
| 44999.197916666664 | 17.46 |
| 44999.208333333336 | 29.38 |
| 44999.21875 | 34.27 |
| 44999.229166666664 | 29.98 |
| 44999.239583333336 | 14.9 |
| 44999.25 | 37.6 |
| 44999.260416666664 | 9.4 |
| 44999.270833333336 | 2.06 |
| 44999.28125 | 1.85 |
| 44999.291666666664 | 1.89 |
| 44999.302083333336 | 1.95 |
| 44999.3125 | 1.62 |
| 44999.322916666664 | 1.93 |
| 44999.333333333336 | 2.25 |
| 44999.34375 | 2.3 |
| 44999.354166666664 | 3.36 |
| 44999.364583333336 | 3.23 |
| 44999.375 | 3.43 |
| 44999.385416666664 | 3.15 |
| 44999.395833333336 | 3.05 |
| 44999.40625 | 3.18 |
| 44999.416666666664 | 3.03 |
| 44999.427083333336 | 3.84 |
| 44999.4375 | 556.91 |
| 44999.447916666664 | 308.88 |
| 44999.458333333336 | 14.63 |
| 44999.46875 | 4.37 |
| 44999.479166666664 | 7.28 |
| 44999.489583333336 | 6.8 |
| 44999.5 | 12.32 |
| 44999.510416666664 | 11.44 |
| 44999.520833333336 | 9.66 |
| 44999.53125 | 135.09 |
| 44999.541666666664 | 7.26 |
| 44999.552083333336 | 4.66 |
| 44999.5625 | 3.87 |
| 44999.572916666664 | 4.43 |
| 44999.583333333336 | 4.31 |
| 44999.59375 | 4.01 |
| 44999.604166666664 | 5.03 |
| 44999.614583333336 | 2.81 |
| 44999.625 | 3.61 |
| 44999.635416666664 | 2.2 |
| 44999.645833333336 | 2.26 |
| 44999.65625 | 2.54 |
| 44999.666666666664 | 2.35 |
| 44999.677083333336 | 2.65 |
| 44999.6875 | 2.13 |
| 44999.697916666664 | 2.56 |
| 44999.708333333336 | 3.32 |
| 44999.71875 | 3.07 |
| 44999.729166666664 | 3.62 |
| 44999.739583333336 | 3.76 |
| 44999.75 | 3.04 |
| 44999.760416666664 | 3.48 |
| 44999.770833333336 | 3.25 |
| 44999.78125 | 2.69 |
| 44999.791666666664 | 2.51 |
| 44999.802083333336 | 3.49 |
| 44999.8125 | 3.01 |
| 44999.822916666664 | 3.94 |
| 44999.833333333336 | 6.62 |
| 44999.84375 | 9.44 |
| 44999.854166666664 | 6.96 |
| 44999.864583333336 | 10.6 |
| 44999.875 | 345.32 |
| 44999.885416666664 | 209.18 |
| 44999.895833333336 | 17.53 |
| 44999.90625 | 89.2 |
| 44999.916666666664 | 93.45 |
| 44999.927083333336 | 103.36 |
| 44999.9375 | 9.89 |
| 44999.947916666664 | 11.29 |
| 44999.958333333336 | 25.07 |
| 44999.96875 | 14.79 |
| 44999.979166666664 | 14.47 |
| 44999.989583333336 | 11.21 |
| 45000.0 | 14.42 |
| 45000.010416666664 | 14.91 |
| 45000.020833333336 | 19 |
| 45000.03125 | 12.58 |
| 45000.041666666664 | 12.7 |
| 45000.052083333336 | 14.72 |
| 45000.0625 | 11.18 |
| 45000.072916666664 | 9.17 |
| 45000.083333333336 | 9.56 |
| 45000.09375 | 8.4 |
| 45000.104166666664 | 6.64 |
| 45000.114583333336 | 5.54 |
| 45000.125 | 5.35 |
| 45000.135416666664 | 6.04 |
| 45000.145833333336 | 5.68 |
| 45000.15625 | 3.92 |
| 45000.166666666664 | 4.03 |
| 45000.177083333336 | 4.71 |
| 45000.1875 | 4.75 |
| 45000.197916666664 | 5.1 |
| 45000.208333333336 | 4.51 |
| 45000.21875 | 4.87 |
| 45000.229166666664 | 12.36 |
| 45000.239583333336 | 20.58 |
| 45000.25 | 13.43 |
| 45000.260416666664 | 38.1 |
| 45000.270833333336 | 17.92 |
| 45000.28125 | 8.24 |
| 45000.291666666664 | 42.51 |
| 45000.302083333336 | 5.94 |
| 45000.3125 | 5.13 |
| 45000.322916666664 | 5.42 |
| 45000.333333333336 | 5.38 |
| 45000.34375 | 5.65 |
| 45000.354166666664 | 6.1 |
| 45000.364583333336 | 5.07 |
| 45000.375 | 6.77 |
| 45000.385416666664 | 5.3 |
| 45000.395833333336 | 560.62 |
| 45000.40625 | 331.07 |
| 45000.416666666664 | 5.66 |
| 45000.427083333336 | 22.56 |
| 45000.4375 | 41.96 |
| 45000.447916666664 | 41.89 |
| 45000.458333333336 | 15.86 |
| 45000.46875 | 160.64 |
| 45000.479166666664 | 143.35 |
| 45000.489583333336 | 15.98 |
| 45000.5 | 13.86 |
| 45000.510416666664 | 50.59 |
| 45000.520833333336 | 257.84 |
| 45000.53125 | 34.66 |
| 45000.541666666664 | 142.1 |
| 45000.552083333336 | 10.09 |
| 45000.5625 | 8.65 |
| 45000.572916666664 | 8.98 |
| 45000.583333333336 | 9.15 |
| 45000.59375 | 9.01 |
| 45000.604166666664 | 12.97 |
| 45000.614583333336 | 7.87 |
| 45000.625 | 17.88 |
| 45000.635416666664 | 6.59 |
| 45000.645833333336 | 6.38 |
| 45000.65625 | 11.45 |
| 45000.666666666664 | 7.72 |
| 45000.677083333336 | 7.76 |
| 45000.6875 | 8.16 |
| 45000.697916666664 | 9.07 |
| 45000.708333333336 | 21 |
| 45000.71875 | 5 |
| 45000.729166666664 | 6.51 |
| 45000.739583333336 | 5.92 |
| 45000.75 | 6.6 |
| 45000.760416666664 | 6.99 |
| 45000.770833333336 | 6.18 |
| 45000.78125 | 6.13 |
| 45000.791666666664 | 6.67 |
| 45000.802083333336 | 6.13 |
| 45000.8125 | 29.09 |
| 45000.822916666664 | 5.58 |
| 45000.833333333336 | 5.46 |
| 45000.84375 | 4.77 |
| 45000.854166666664 | 4.97 |
| 45000.864583333336 | 5.62 |
| 45000.875 | 5.53 |
| 45000.885416666664 | 6.83 |
| 45000.895833333336 | 6.48 |
| 45000.90625 | 5.8 |
| 45000.916666666664 | 6.04 |
| 45000.927083333336 | 6.86 |
| 45000.9375 | 5.77 |
| 45000.947916666664 | 8.11 |
| 45000.958333333336 | 10.62 |
| 45000.96875 | 6.66 |
| 45000.979166666664 | 6.62 |
| 45000.989583333336 | 6.69 |
| 45001.0 | 5.97 |
| 45001.010416666664 | 6.16 |
| 45001.020833333336 | 5.42 |
| 45001.03125 | 6.49 |
| 45001.041666666664 | 4.57 |
| 45001.052083333336 | 4.82 |
| 45001.0625 | 4.55 |
| 45001.072916666664 | 4.45 |
| 45001.083333333336 | 4.57 |
| 45001.09375 | 4.32 |
| 45001.104166666664 | 4.92 |
| 45001.114583333336 | 3.42 |
| 45001.125 | 4.79 |
| 45001.135416666664 | 5.32 |
| 45001.145833333336 | 5.72 |
| 45001.15625 | 6.09 |
| 45001.166666666664 | 5.63 |
| 45001.177083333336 | 8.59 |
| 45001.1875 | 19.6 |
| 45001.197916666664 | 5.12 |
| 45001.208333333336 | 5.28 |
| 45001.21875 | 8.57 |
| 45001.229166666664 | 6.76 |
| 45001.239583333336 | 4.33 |
| 45001.25 | 583.56 |
| 45001.260416666664 | 5.36 |
| 45001.270833333336 | 5.16 |
| 45001.28125 | 21.27 |
| 45001.291666666664 | 5.73 |
| 45001.302083333336 | 6.94 |
| 45001.3125 | 6.57 |
| 45001.322916666664 | 6.83 |
| 45001.333333333336 | 11.1 |
| 45001.34375 | 6.9 |
| 45001.354166666664 | 5.42 |
| 45001.364583333336 | 4.72 |
| 45001.375 | 4.61 |
| 45001.385416666664 | 4.62 |
| 45001.395833333336 | 3.62 |
| 45001.40625 | 5.38 |
| 45001.416666666664 | 3.36 |
| 45001.427083333336 | 5.03 |
| 45001.4375 | 4.41 |
| 45001.447916666664 | 3.91 |
| 45001.458333333336 | 4.1 |
| 45001.46875 | 4.07 |
| 45001.479166666664 | 4.2 |
| 45001.489583333336 | 9.77 |
| 45001.5 | 5.11 |
| 45001.510416666664 | 5.15 |
| 45001.520833333336 | 9.72 |
| 45001.53125 | 12.87 |
| 45001.541666666664 | 4.87 |
| 45001.552083333336 | 5.25 |
| 45001.5625 | 5.6 |
| 45001.572916666664 | 4.03 |
| 45001.583333333336 | 4.85 |
| 45001.59375 | 14.05 |
| 45001.604166666664 | 4.37 |
| 45001.614583333336 | 3.73 |
| 45001.625 | 3.01 |
| 45001.635416666664 | 3.04 |
| 45001.645833333336 | 3.34 |
| 45001.65625 | 4.24 |
| 45001.666666666664 | 4.24 |
| 45001.677083333336 | 3.3 |
| 45001.6875 | 2.78 |
| 45001.697916666664 | 5.26 |
| 45001.708333333336 | 115.25 |
| 45001.71875 | 6.26 |
| 45001.729166666664 | 2.97 |
| 45001.739583333336 | 3.29 |
| 45001.75 | 3.19 |
| 45001.760416666664 | 3.55 |
| 45001.770833333336 | 2.71 |
| 45001.78125 | 3.38 |
| 45001.791666666664 | 2.77 |
| 45001.802083333336 | 3.89 |
| 45001.8125 | 3.21 |
| 45001.822916666664 | 2.1 |
| 45001.833333333336 | 2.87 |
| 45001.84375 | 2.09 |
| 45001.854166666664 | 2.3 |
| 45001.864583333336 | 2.34 |
| 45001.875 | 2.39 |
| 45001.885416666664 | 2.61 |
| 45001.895833333336 | 2.21 |
| 45001.90625 | 2.44 |
| 45001.916666666664 | 2.77 |
| 45001.927083333336 | 2.74 |
| 45001.9375 | 2.8 |
| 45001.947916666664 | 2.74 |
| 45001.958333333336 | 2.81 |
| 45001.96875 | 2.59 |
| 45001.979166666664 | 8.36 |
| 45001.989583333336 | 5.54 |
| 45002.0 | 21.66 |
| 45002.010416666664 | 4 |
| 45002.020833333336 | 140.44 |
| 45002.03125 | 66.56 |
| 45002.041666666664 | 4.85 |
| 45002.052083333336 | 38.42 |
| 45002.0625 | 17.85 |
| 45002.072916666664 | 26.78 |
| 45002.083333333336 | 8.55 |
| 45002.09375 | 6.28 |
| 45002.104166666664 | 9.27 |
| 45002.114583333336 | 4.73 |
| 45002.125 | 4.88 |
| 45002.135416666664 | 5.64 |
| 45002.145833333336 | 4.83 |
| 45002.15625 | 4.83 |
| 45002.166666666664 | 4.12 |
| 45002.177083333336 | 4.23 |
| 45002.1875 | 3.94 |
| 45002.197916666664 | 3.93 |
| 45002.208333333336 | 3.26 |
| 45002.21875 | 3.11 |
| 45002.229166666664 | 3.1 |
| 45002.239583333336 | 2.91 |
| 45002.25 | 5.08 |
| 45002.260416666664 | 4.63 |
| 45002.270833333336 | 7.7 |
| 45002.28125 | 4.1 |
| 45002.291666666664 | 4.04 |
| 45002.302083333336 | 10.61 |
| 45002.3125 | 8.28 |
| 45002.322916666664 | 8.6 |
| 45002.333333333336 | 5.97 |
| 45002.34375 | 15.59 |
| 45002.354166666664 | 9.34 |
| 45002.364583333336 | 8.08 |
| 45002.375 | 13.3 |
| 45002.385416666664 | 12.38 |
| 45002.395833333336 | 5.62 |
| 45002.40625 | 3.27 |
| 45002.416666666664 | 3.58 |
| 45002.427083333336 | 3.6 |
| 45002.4375 | 6.31 |
| 45002.447916666664 | 10.39 |
| 45002.458333333336 | 35.18 |
| 45002.46875 | 30.46 |
| 45002.479166666664 | 4.76 |
| 45002.489583333336 | 595.63 |
| 45002.5 | 14.27 |
| 45002.510416666664 | 5.52 |
| 45002.520833333336 | 23.61 |
| 45002.53125 | 5.13 |
| 45002.541666666664 | 7.03 |
| 45002.552083333336 | 14.42 |
| 45002.5625 | 6.65 |
| 45002.572916666664 | 3.82 |
| 45002.583333333336 | 6.11 |
| 45002.59375 | 4.79 |
| 45002.604166666664 | 549.23 |
| 45002.614583333336 | 54.29 |
| 45002.625 | 10.54 |
| 45002.635416666664 | 7.55 |
| 45002.645833333336 | 5.6 |
| 45002.65625 | 5.31 |
| 45002.666666666664 | 4.32 |
| 45002.677083333336 | 3.5 |
| 45002.6875 | 4.1 |
| 45002.697916666664 | 4.07 |
| 45002.708333333336 | 3.92 |
| 45002.71875 | 3.73 |
| 45002.729166666664 | 3.66 |
| 45002.739583333336 | 3.33 |
| 45002.75 | 3.46 |
| 45002.760416666664 | 3.74 |
| 45002.770833333336 | 2.99 |
| 45002.78125 | 3.33 |
| 45002.791666666664 | 2.93 |
| 45002.802083333336 | 2.71 |
| 45002.8125 | 3.26 |
| 45002.822916666664 | 3.88 |
| 45002.833333333336 | 3.76 |
| 45002.84375 | 3.66 |
| 45002.854166666664 | 3.65 |
| 45002.864583333336 | 4.26 |
| 45002.875 | 3.6 |
| 45002.885416666664 | 3.43 |
| 45002.895833333336 | 3.99 |
| 45002.90625 | 2.74 |
| 45002.916666666664 | 2.76 |
| 45002.927083333336 | 2.75 |
| 45002.9375 | 2.51 |
| 45002.947916666664 | 2.53 |
| 45002.958333333336 | 2.84 |
| 45002.96875 | 3.28 |
| 45002.979166666664 | 3.32 |
| 45002.989583333336 | 3.78 |
| 45003.0 | 3.99 |
| 45003.010416666664 | 3.62 |
| 45003.020833333336 | 4.16 |
| 45003.03125 | 33.38 |
| 45003.041666666664 | 252.39 |
| 45003.052083333336 | 176.41 |
| 45003.0625 | 79.13 |
| 45003.072916666664 | 25.24 |
| 45003.083333333336 | 12.27 |
| 45003.09375 | 101.24 |
| 45003.104166666664 | 153.31 |
| 45003.114583333336 | 71.92 |
| 45003.125 | 8.28 |
| 45003.135416666664 | 13.62 |
| 45003.145833333336 | 22.94 |
| 45003.15625 | 6.76 |
| 45003.166666666664 | 6.71 |
| 45003.177083333336 | 9.79 |
| 45003.1875 | 8.61 |
| 45003.197916666664 | 7.99 |
| 45003.208333333336 | 7.15 |
| 45003.21875 | 6.56 |
| 45003.229166666664 | 5.59 |
| 45003.239583333336 | 4.58 |
| 45003.25 | 3.86 |
| 45003.260416666664 | 4.15 |
| 45003.270833333336 | 4.88 |
| 45003.28125 | 3.85 |
| 45003.291666666664 | 3.22 |
| 45003.302083333336 | 5.35 |
| 45003.3125 | 4.83 |
| 45003.322916666664 | 3.5 |
| 45003.333333333336 | 12.54 |
| 45003.34375 | 4.39 |
| 45003.354166666664 | 5.75 |
| 45003.364583333336 | 8.25 |
| 45003.375 | 4.01 |
| 45003.385416666664 | 5.09 |
| 45003.395833333336 | 23.1 |
| 45003.40625 | 15.95 |
| 45003.416666666664 | 8.06 |
| 45003.427083333336 | 12.26 |
| 45003.4375 | 4.64 |
| 45003.447916666664 | 5.11 |
| 45003.458333333336 | 4.27 |
| 45003.46875 | 3.1 |
| 45003.479166666664 | 3.43 |
| 45003.489583333336 | 3.77 |
| 45003.5 | 3.97 |
| 45003.510416666664 | 3.93 |
| 45003.520833333336 | 4.13 |
| 45003.53125 | 518.96 |
| 45003.541666666664 | 4.58 |
| 45003.552083333336 | 5.21 |
| 45003.5625 | 4.84 |
| 45003.572916666664 | 5.86 |
| 45003.583333333336 | 5.43 |
| 45003.59375 | 5.41 |
| 45003.604166666664 | 6.89 |
| 45003.614583333336 | 5.72 |
| 45003.625 | 6.02 |
| 45003.635416666664 | 6.12 |
| 45003.645833333336 | 6.7 |
| 45003.65625 | 7.26 |
| 45003.666666666664 | 7.5 |
| 45003.677083333336 | 11.07 |
| 45003.6875 | 7.28 |
| 45003.697916666664 | 8.4 |
| 45003.708333333336 | 7.37 |
| 45003.71875 | 6.1 |
| 45003.729166666664 | 7.59 |
| 45003.739583333336 | 5.06 |
| 45003.75 | 6.5 |
| 45003.760416666664 | 10.53 |
| 45003.770833333336 | 4.45 |
| 45003.78125 | 256.83 |
| 45003.791666666664 | 3.5 |
| 45003.802083333336 | 3.25 |
| 45003.8125 | 3.49 |
| 45003.822916666664 | 3.39 |
| 45003.833333333336 | 7.76 |
| 45003.84375 | 5.92 |
| 45003.854166666664 | 3.08 |
| 45003.864583333336 | 2.93 |
| 45003.875 | 2.78 |
| 45003.885416666664 | 3.03 |
| 45003.895833333336 | 2.85 |
| 45003.90625 | 2.9 |
| 45003.916666666664 | 2.64 |
| 45003.927083333336 | 2.75 |
| 45003.9375 | 2.73 |
| 45003.947916666664 | 2.78 |
| 45003.958333333336 | 2.92 |
| 45003.96875 | 2.91 |
| 45003.979166666664 | 2.89 |
| 45003.989583333336 | 2.74 |
| 45004.0 | 2.34 |
| 45004.010416666664 | 2.2 |
| 45004.020833333336 | 2.31 |
| 45004.03125 | 2.61 |
| 45004.041666666664 | 3.32 |
| 45004.052083333336 | 8.06 |
| 45004.0625 | 16.38 |
| 45004.072916666664 | 4.81 |
| 45004.083333333336 | 5.5 |
| 45004.09375 | 94.29 |
| 45004.104166666664 | 17.45 |
| 45004.114583333336 | 261.91 |
| 45004.125 | 6.41 |
| 45004.135416666664 | 3.53 |
| 45004.145833333336 | 4.48 |
| 45004.15625 | 5.03 |
| 45004.166666666664 | 5.99 |
| 45004.177083333336 | 5.48 |
| 45004.1875 | 5.6 |
| 45004.197916666664 | 30.35 |
| 45004.208333333336 | 12.97 |
| 45004.21875 | 31.67 |
| 45004.229166666664 | 6.53 |
| 45004.239583333336 | 5.97 |
| 45004.25 | 5.71 |
| 45004.260416666664 | 5.02 |
| 45004.270833333336 | 4.65 |
| 45004.28125 | 4.01 |
| 45004.291666666664 | 3.57 |
| 45004.302083333336 | 3.36 |
| 45004.3125 | 2.87 |
| 45004.322916666664 | 2.64 |
| 45004.333333333336 | 2.71 |
| 45004.34375 | 3.16 |
| 45004.354166666664 | 2.67 |
| 45004.364583333336 | 2.59 |
| 45004.375 | 2.31 |
| 45004.385416666664 | 2.65 |
| 45004.395833333336 | 3.24 |
| 45004.40625 | 3.15 |
| 45004.416666666664 | 3.65 |
| 45004.427083333336 | 4.83 |
| 45004.4375 | 3.79 |
| 45004.447916666664 | 3.92 |
| 45004.458333333336 | 4.03 |
| 45004.46875 | 4.02 |
| 45004.479166666664 | 3.71 |
| 45004.489583333336 | 2.78 |
| 45004.5 | 2.6 |
| 45004.510416666664 | 2.5 |
| 45004.520833333336 | 2.28 |
| 45004.53125 | 2.34 |
| 45004.541666666664 | 1.88 |
| 45004.552083333336 | 2.32 |
| 45004.5625 | 2.34 |
| 45004.572916666664 | 2.45 |
| 45004.583333333336 | 2.82 |
| 45004.59375 | 3.36 |
| 45004.604166666664 | 3.36 |
| 45004.614583333336 | 4.31 |
| 45004.625 | 4.31 |
| 45004.635416666664 | 9.76 |
| 45004.645833333336 | 22.87 |
| 45004.65625 | 10.26 |
| 45004.666666666664 | 46.63 |
| 45004.677083333336 | 68.45 |
| 45004.6875 | 100.1 |
| 45004.697916666664 | 40.52 |
| 45004.708333333336 | 43.37 |
| 45004.71875 | 58.17 |
| 45004.729166666664 | 7.38 |
| 45004.739583333336 | 8.73 |
| 45004.75 | 7.1 |
| 45004.760416666664 | 5.03 |
| 45004.770833333336 | 5.57 |
| 45004.78125 | 4.84 |
| 45004.791666666664 | 5.48 |
| 45004.802083333336 | 4.55 |
| 45004.8125 | 4.05 |
| 45004.822916666664 | 4.08 |
| 45004.833333333336 | 4.03 |
| 45004.84375 | 3.85 |
| 45004.854166666664 | 3.34 |
| 45004.864583333336 | 2.98 |
| 45004.875 | 2.9 |
| 45004.885416666664 | 3.09 |
| 45004.895833333336 | 3.05 |
| 45004.90625 | 4.49 |
| 45004.916666666664 | 5.9 |
| 45004.927083333336 | 11.57 |
| 45004.9375 | 12.43 |
| 45004.947916666664 | 11.74 |
| 45004.958333333336 | 8.43 |
| 45004.96875 | 19.69 |
| 45004.979166666664 | 6.77 |
| 45004.989583333336 | 3.84 |
| 45005.0 | 2.98 |
| 45005.010416666664 | 2.51 |
| 45005.020833333336 | 2.58 |
| 45005.03125 | 2.39 |
| 45005.041666666664 | 2.5 |
| 45005.052083333336 | 2.53 |
| 45005.0625 | 2.37 |
| 45005.072916666664 | 2.57 |
| 45005.083333333336 | 2.96 |
| 45005.09375 | 2.95 |
| 45005.104166666664 | 3.08 |
| 45005.114583333336 | 3.46 |
| 45005.125 | 3.82 |
| 45005.135416666664 | 4.09 |
| 45005.145833333336 | 4.68 |
| 45005.15625 | 5.3 |
| 45005.166666666664 | 5.38 |
| 45005.177083333336 | 5.88 |
| 45005.1875 | 5.97 |
| 45005.197916666664 | 6.31 |
| 45005.208333333336 | 6.58 |
| 45005.21875 | 5.89 |
| 45005.229166666664 | 6.32 |
| 45005.239583333336 | 6.88 |
| 45005.25 | 6.91 |
| 45005.260416666664 | 5.71 |
| 45005.270833333336 | 5.65 |
| 45005.28125 | 42.13 |
| 45005.291666666664 | 15.49 |
| 45005.302083333336 | 7.44 |
| 45005.3125 | 6.77 |
| 45005.322916666664 | 8.73 |
| 45005.333333333336 | 8.13 |
| 45005.34375 | 13.31 |
| 45005.354166666664 | 2.85 |
| 45005.364583333336 | 4.42 |
| 45005.375 | 10.84 |
| 45005.385416666664 | 5.41 |
| 45005.395833333336 | 4.05 |
| 45005.40625 | 5.39 |
| 45005.416666666664 | 3.79 |
| 45005.427083333336 | 6.08 |
| 45005.4375 | 8.76 |
| 45005.447916666664 | 8.47 |
| 45005.458333333336 | 11.58 |
| 45005.46875 | 53.67 |
| 45005.479166666664 | 12.67 |
| 45005.489583333336 | 23.57 |
| 45005.5 | 59.14 |
| 45005.510416666664 | 13.19 |
| 45005.520833333336 | 3.18 |
| 45005.53125 | 3 |
| 45005.541666666664 | 2.97 |
| 45005.552083333336 | 3.16 |
| 45005.5625 | 2.68 |
| 45005.572916666664 | 2.84 |
| 45005.583333333336 | 3.21 |
| 45005.59375 | 3.57 |
| 45005.604166666664 | 3.76 |
| 45005.614583333336 | 4.23 |
| 45005.625 | 4.67 |
| 45005.635416666664 | 4.34 |
| 45005.645833333336 | 4.78 |
| 45005.65625 | 4.67 |
| 45005.666666666664 | 4.82 |
| 45005.677083333336 | 9.5 |
| 45005.6875 | 7.51 |
| 45005.697916666664 | 7.48 |
| 45005.708333333336 | 6.9 |
| 45005.71875 | 8.29 |
| 45005.729166666664 | 7.03 |
| 45005.739583333336 | 6.13 |
| 45005.75 | 5.98 |
| 45005.760416666664 | 5.1 |
| 45005.770833333336 | 5.24 |
| 45005.78125 | 5.89 |
| 45005.791666666664 | 3.42 |
| 45005.802083333336 | 4.23 |
| 45005.8125 | 3.93 |
| 45005.822916666664 | 8.71 |
| 45005.833333333336 | 9.65 |
| 45005.84375 | 6.39 |
| 45005.854166666664 | 10.65 |
| 45005.864583333336 | 77.76 |
| 45005.875 | 8.17 |
| 45005.885416666664 | 3.14 |
| 45005.895833333336 | 7.72 |
| 45005.90625 | 2.9 |
| 45005.916666666664 | 6.01 |
| 45005.927083333336 | 5.49 |
| 45005.9375 | 8.14 |
| 45005.947916666664 | 4.39 |
| 45005.958333333336 | 4.05 |
| 45005.96875 | 7.71 |
| 45005.979166666664 | 5.99 |
| 45005.989583333336 | 14.24 |
| 45006.0 | 8.44 |
| 45006.010416666664 | 4.59 |
| 45006.020833333336 | 4.11 |
| 45006.03125 | 4.23 |
| 45006.041666666664 | 2.42 |
| 45006.052083333336 | 2.36 |
| 45006.0625 | 2.31 |
| 45006.072916666664 | 2.39 |
| 45006.083333333336 | 2.28 |
| 45006.09375 | 2.44 |
| 45006.104166666664 | 2.66 |
| 45006.114583333336 | 3.46 |
| 45006.125 | 2.83 |
| 45006.135416666664 | 3.81 |
| 45006.145833333336 | 3.83 |
| 45006.15625 | 4.22 |
| 45006.166666666664 | 4.65 |
| 45006.177083333336 | 12.17 |
| 45006.1875 | 5.21 |
| 45006.197916666664 | 5.74 |
| 45006.208333333336 | 13.83 |
| 45006.21875 | 4.56 |
| 45006.229166666664 | 5.79 |
| 45006.239583333336 | 5.8 |
| 45006.25 | 5.78 |
| 45006.260416666664 | 6.72 |
| 45006.270833333336 | 9.18 |
| 45006.28125 | 15.37 |
| 45006.291666666664 | 6.3 |
| 45006.302083333336 | 5.28 |
| 45006.3125 | 6.91 |
| 45006.322916666664 | 10.23 |
| 45006.333333333336 | 6.59 |
| 45006.34375 | 6.84 |
| 45006.354166666664 | 6.76 |
| 45006.364583333336 | 7.23 |
| 45006.375 | 5.07 |
| 45006.385416666664 | 6.27 |
| 45006.395833333336 | 5.19 |
| 45006.40625 | 3.31 |
| 45006.416666666664 | 3.89 |
| 45006.427083333336 | 2.76 |
| 45006.4375 | 3.83 |
| 45006.447916666664 | 3.55 |
| 45006.458333333336 | 3.49 |
| 45006.46875 | 3.01 |
| 45006.479166666664 | 242.24 |
| 45006.489583333336 | 77.62 |
| 45006.5 | 97.17 |
| 45006.510416666664 | 206.31 |
| 45006.520833333336 | 26.95 |
| 45006.53125 | 144.73 |
| 45006.541666666664 | 188.02 |
| 45006.552083333336 | 98.81 |
| 45006.5625 | 2.85 |
| 45006.572916666664 | 2.04 |
| 45006.583333333336 | 1.95 |
| 45006.59375 | 1.77 |
| 45006.604166666664 | 1.85 |
| 45006.614583333336 | 2.1 |
| 45006.625 | 1.76 |
| 45006.635416666664 | 1.78 |
| 45006.645833333336 | 135.83 |
| 45006.65625 | 542.37 |
| 45006.666666666664 | 2.84 |
| 45006.677083333336 | 3.09 |
| 45006.6875 | 4.03 |
| 45006.697916666664 | 41.94 |
| 45006.708333333336 | 49.99 |
| 45006.71875 | 63.34 |
| 45006.729166666664 | 371.44 |
| 45006.739583333336 | 590.24 |
| 45006.75 | 162.68 |
| 45006.760416666664 | 33.14 |
| 45006.770833333336 | 30.28 |
| 45006.78125 | 98.3 |
| 45006.791666666664 | 39.18 |
| 45006.802083333336 | 12.25 |
| 45006.8125 | 4.96 |
| 45006.822916666664 | 3.83 |
| 45006.833333333336 | 4.39 |
| 45006.84375 | 5.53 |
| 45006.854166666664 | 5.54 |
| 45006.864583333336 | 4.41 |
| 45006.875 | 4.22 |
| 45006.885416666664 | 3.75 |
| 45006.895833333336 | 3.23 |
| 45006.90625 | 3.17 |
| 45006.916666666664 | 3.12 |
| 45006.927083333336 | 3.07 |
| 45006.9375 | 2.83 |
| 45006.947916666664 | 3.06 |
| 45006.958333333336 | 2.71 |
| 45006.96875 | 2.8 |
| 45006.979166666664 | 2.66 |
| 45006.989583333336 | 3.02 |
| 45007.0 | 3.16 |
| 45007.010416666664 | 3.47 |
| 45007.020833333336 | 3.42 |
| 45007.03125 | 3.47 |
| 45007.041666666664 | 2.92 |
| 45007.052083333336 | 3.38 |
| 45007.0625 | 2.93 |
| 45007.072916666664 | 3.36 |
| 45007.083333333336 | 3.28 |
| 45007.09375 | 3.73 |
| 45007.104166666664 | 3.04 |
| 45007.114583333336 | 11.91 |
| 45007.125 | 3.54 |
| 45007.135416666664 | 3.42 |
| 45007.145833333336 | 3.26 |
| 45007.15625 | 3.62 |
| 45007.166666666664 | 3.56 |
| 45007.177083333336 | 2.98 |
| 45007.1875 | 3.79 |
| 45007.197916666664 | 3.62 |
| 45007.208333333336 | 4.3 |
| 45007.21875 | 3.92 |
| 45007.229166666664 | 3.89 |
| 45007.239583333336 | 6.36 |
| 45007.25 | 4.33 |
| 45007.260416666664 | 8.52 |
| 45007.270833333336 | 5.02 |
| 45007.28125 | 5.65 |
| 45007.291666666664 | 6.27 |
| 45007.302083333336 | 8.21 |
| 45007.3125 | 37.14 |
| 45007.322916666664 | 93.03 |
| 45007.333333333336 | 76.1 |
| 45007.34375 | 5.91 |
| 45007.354166666664 | 5.96 |
| 45007.364583333336 | 5.82 |
| 45007.375 | 6.12 |
| 45007.385416666664 | 5.42 |
| 45007.395833333336 | 4.63 |
| 45007.40625 | 4.14 |
| 45007.416666666664 | 3.75 |
| 45007.427083333336 | 3.19 |
| 45007.4375 | 2.97 |
| 45007.447916666664 | 2.72 |
| 45007.458333333336 | 2.47 |
| 45007.46875 | 3.22 |
| 45007.479166666664 | 3.17 |
| 45007.489583333336 | 30.96 |
| 45007.5 | 3.78 |
| 45007.510416666664 | 4.01 |
| 45007.520833333336 | 3.54 |
| 45007.53125 | 5.19 |
| 45007.541666666664 | 4.39 |
| 45007.552083333336 | 4.82 |
| 45007.5625 | 3.85 |
| 45007.572916666664 | 4.1 |
| 45007.583333333336 | 4.07 |
| 45007.59375 | 3.64 |
| 45007.604166666664 | 26.42 |
| 45007.614583333336 | 19.19 |
| 45007.625 | 22.18 |
| 45007.635416666664 | 311.35 |
| 45007.645833333336 | 123.95 |
| 45007.65625 | 68.51 |
| 45007.666666666664 | 25.79 |
| 45007.677083333336 | 14.2 |
| 45007.6875 | 4.77 |
| 45007.697916666664 | 3.52 |
| 45007.708333333336 | 3.5 |
| 45007.71875 | 16.78 |
| 45007.729166666664 | 4.69 |
| 45007.739583333336 | 6.17 |
| 45007.75 | 4.02 |
| 45007.760416666664 | 5.88 |
| 45007.770833333336 | 5.85 |
| 45007.78125 | 6.44 |
| 45007.791666666664 | 5.55 |
| 45007.802083333336 | 45.02 |
| 45007.8125 | 8.53 |
| 45007.822916666664 | 18.67 |
| 45007.833333333336 | 9.28 |
| 45007.84375 | 8.62 |
| 45007.854166666664 | 7.49 |
| 45007.864583333336 | 8.64 |
| 45007.875 | 9.27 |
| 45007.885416666664 | 7.19 |
| 45007.895833333336 | 6.26 |
| 45007.90625 | 5.17 |
| 45007.916666666664 | 5.1 |
| 45007.927083333336 | 4.21 |
| 45007.9375 | 3.7 |
| 45007.947916666664 | 3.43 |
| 45007.958333333336 | 3.06 |
| 45007.96875 | 3.62 |
| 45007.979166666664 | 3.3 |
| 45007.989583333336 | 3.25 |
| 45008.0 | 3.04 |
| 45008.010416666664 | 3.2 |
| 45008.020833333336 | 3.24 |
| 45008.03125 | 3.29 |
| 45008.041666666664 | 4.06 |
| 45008.052083333336 | 3.82 |
| 45008.0625 | 4.22 |
| 45008.072916666664 | 3.86 |
| 45008.083333333336 | 3.95 |
| 45008.09375 | 3.96 |
| 45008.104166666664 | 3.39 |
| 45008.114583333336 | 3.03 |
| 45008.125 | 2.79 |
| 45008.135416666664 | 2.9 |
| 45008.145833333336 | 2.94 |
| 45008.15625 | 2.62 |
| 45008.166666666664 | 2.52 |
| 45008.177083333336 | 3.01 |
| 45008.1875 | 3.27 |
| 45008.197916666664 | 3.08 |
| 45008.208333333336 | 3.41 |
| 45008.21875 | 3.5 |
| 45008.229166666664 | 3.82 |
| 45008.239583333336 | 3.76 |
| 45008.25 | 4 |
| 45008.260416666664 | 3.91 |
| 45008.270833333336 | 4.07 |
| 45008.28125 | 4.14 |
| 45008.291666666664 | 4.91 |
| 45008.302083333336 | 4.62 |
| 45008.3125 | 5.16 |
| 45008.322916666664 | 5.79 |
| 45008.333333333336 | 5.62 |
| 45008.34375 | 5.93 |
| 45008.354166666664 | 6.21 |
| 45008.364583333336 | 6.79 |
| 45008.375 | 5.95 |
| 45008.385416666664 | 5.97 |
| 45008.395833333336 | 6.33 |
| 45008.40625 | 53.76 |
| 45008.416666666664 | 20.58 |
| 45008.427083333336 | 9.34 |
| 45008.4375 | 15.72 |
| 45008.447916666664 | 4.4 |
| 45008.458333333336 | 22.51 |
| 45008.46875 | 2.97 |
| 45008.479166666664 | 30.47 |
| 45008.489583333336 | 3.09 |
| 45008.5 | 3.3 |
| 45008.510416666664 | 2.55 |
| 45008.520833333336 | 3.51 |
| 45008.53125 | 4.17 |
| 45008.541666666664 | 2.4 |
| 45008.552083333336 | 11.97 |
| 45008.5625 | 10.7 |
| 45008.572916666664 | 4.59 |
| 45008.583333333336 | 18.71 |
| 45008.59375 | 4.26 |
| 45008.604166666664 | 4.37 |
| 45008.614583333336 | 2.18 |
| 45008.625 | 1.97 |
| 45008.635416666664 | 1.91 |
| 45008.645833333336 | 1.81 |
| 45008.65625 | 2.96 |
| 45008.666666666664 | 1.82 |
| 45008.677083333336 | 1.98 |
| 45008.6875 | 2.07 |
| 45008.697916666664 | 2 |
| 45008.708333333336 | 2.36 |
| 45008.71875 | 2.11 |
| 45008.729166666664 | 2.22 |
| 45008.739583333336 | 2.48 |
| 45008.75 | 2.81 |
| 45008.760416666664 | 2.48 |
| 45008.770833333336 | 2.7 |
| 45008.78125 | 3.09 |
| 45008.791666666664 | 3.93 |
| 45008.802083333336 | 4.83 |
| 45008.8125 | 4.41 |
| 45008.822916666664 | 5.16 |
| 45008.833333333336 | 5.36 |
| 45008.84375 | 7.07 |
| 45008.854166666664 | 7.17 |
| 45008.864583333336 | 9.26 |
| 45008.875 | 8.75 |
| 45008.885416666664 | 7.83 |
| 45008.895833333336 | 5.86 |
| 45008.90625 | 4.75 |
| 45008.916666666664 | 4.65 |
| 45008.927083333336 | 4.32 |
| 45008.9375 | 3.54 |
| 45008.947916666664 | 3.82 |
| 45008.958333333336 | 3 |
| 45008.96875 | 2.43 |
| 45008.979166666664 | 2.38 |
| 45008.989583333336 | 2.43 |
| 45009.0 | 2.59 |
| 45009.010416666664 | 2.51 |
| 45009.020833333336 | 2.74 |
| 45009.03125 | 2.6 |
| 45009.041666666664 | 2.63 |
| 45009.052083333336 | 3.05 |
| 45009.0625 | 2.97 |
| 45009.072916666664 | 3.06 |
| 45009.083333333336 | 4.3 |
| 45009.09375 | 3.44 |
| 45009.104166666664 | 2.61 |
| 45009.114583333336 | 3.29 |
| 45009.125 | 2.65 |
| 45009.135416666664 | 2.43 |
| 45009.145833333336 | 2.23 |
| 45009.15625 | 2.45 |
| 45009.166666666664 | 2.25 |
| 45009.177083333336 | 2.42 |
| 45009.1875 | 2.52 |
| 45009.197916666664 | 2.36 |
| 45009.208333333336 | 2.32 |
| 45009.21875 | 2.33 |
| 45009.229166666664 | 2.84 |
| 45009.239583333336 | 3.81 |
| 45009.25 | 3.5 |
| 45009.260416666664 | 20.83 |
| 45009.270833333336 | 49.03 |
| 45009.28125 | 83.39 |
| 45009.291666666664 | 5.55 |
| 45009.302083333336 | 6.76 |
| 45009.3125 | 5.84 |
| 45009.322916666664 | 12.15 |
| 45009.333333333336 | 4.25 |
| 45009.34375 | 7.28 |
| 45009.354166666664 | 5.08 |
| 45009.364583333336 | 7.77 |
| 45009.375 | 4.87 |
| 45009.385416666664 | 5.42 |
| 45009.395833333336 | 5.65 |
| 45009.40625 | 5.19 |
| 45009.416666666664 | 5.04 |
| 45009.427083333336 | 5.56 |
| 45009.4375 | 4.87 |
| 45009.447916666664 | 4.3 |
| 45009.458333333336 | 3.49 |
| 45009.46875 | 3.12 |
| 45009.479166666664 | 3.12 |
| 45009.489583333336 | 2.81 |
| 45009.5 | 2.76 |
| 45009.510416666664 | 2.5 |
| 45009.520833333336 | 2.39 |
| 45009.53125 | 2.49 |
| 45009.541666666664 | 2.26 |
| 45009.552083333336 | 1.89 |
| 45009.5625 | 2.04 |
| 45009.572916666664 | 1.96 |
| 45009.583333333336 | 1.91 |
| 45009.59375 | 2.26 |
| 45009.604166666664 | 1.78 |
| 45009.614583333336 | 1.88 |
| 45009.625 | 1.85 |
| 45009.635416666664 | 2.14 |
| 45009.645833333336 | 2.19 |
| 45009.65625 | 2.36 |
| 45009.666666666664 | 2.19 |
| 45009.677083333336 | 2.34 |
| 45009.6875 | 2.24 |
| 45009.697916666664 | 2.36 |
| 45009.708333333336 | 2.35 |
| 45009.71875 | 2.85 |
| 45009.729166666664 | 2.71 |
| 45009.739583333336 | 2.6 |
| 45009.75 | 2.56 |
| 45009.760416666664 | 2.71 |
| 45009.770833333336 | 3.24 |
| 45009.78125 | 3.46 |
| 45009.791666666664 | 3.95 |
| 45009.802083333336 | 3.96 |
| 45009.8125 | 65.75 |
| 45009.822916666664 | 4.52 |
| 45009.833333333336 | 129.73 |
| 45009.84375 | 3.99 |
| 45009.854166666664 | 5.77 |
| 45009.864583333336 | 8.58 |
| 45009.875 | 5.6 |
| 45009.885416666664 | 7.23 |
| 45009.895833333336 | 9.39 |
| 45009.90625 | 6.13 |
| 45009.916666666664 | 6.58 |
| 45009.927083333336 | 6.08 |
| 45009.9375 | 5.81 |
| 45009.947916666664 | 6.98 |
| 45009.958333333336 | 5.46 |
| 45009.96875 | 5.02 |
| 45009.979166666664 | 4.78 |
| 45009.989583333336 | 4.65 |
| 45010.0 | 3.88 |
| 45010.010416666664 | 3.49 |
| 45010.020833333336 | 3.85 |
| 45010.03125 | 3.35 |
| 45010.041666666664 | 3.03 |
| 45010.052083333336 | 3.13 |
| 45010.0625 | 3.06 |
| 45010.072916666664 | 2.79 |
| 45010.083333333336 | 2.92 |
| 45010.09375 | 3.19 |
| 45010.104166666664 | 3.12 |
| 45010.114583333336 | 2.96 |
| 45010.125 | 2.88 |
| 45010.135416666664 | 2.97 |
| 45010.145833333336 | 2.91 |
| 45010.15625 | 2.71 |
| 45010.166666666664 | 2.86 |
| 45010.177083333336 | 2.82 |
| 45010.1875 | 2.71 |
| 45010.197916666664 | 2.83 |
| 45010.208333333336 | 2.72 |
| 45010.21875 | 2.74 |
| 45010.229166666664 | 2.69 |
| 45010.239583333336 | 2.67 |
| 45010.25 | 2.46 |
| 45010.260416666664 | 2.64 |
| 45010.270833333336 | 2.58 |
| 45010.28125 | 2.73 |
| 45010.291666666664 | 2.84 |
| 45010.302083333336 | 2.76 |
| 45010.3125 | 3.04 |
| 45010.322916666664 | 2.8 |
| 45010.333333333336 | 2.8 |
| 45010.34375 | 3.04 |
| 45010.354166666664 | 3.13 |
| 45010.364583333336 | 3.52 |
| 45010.375 | 4.01 |
| 45010.385416666664 | 4.26 |
| 45010.395833333336 | 4.37 |
| 45010.40625 | 4.51 |
| 45010.416666666664 | 4.35 |
| 45010.427083333336 | 4.39 |
| 45010.4375 | 4.53 |
| 45010.447916666664 | 4.62 |
| 45010.458333333336 | 4.43 |
| 45010.46875 | 4.14 |
| 45010.479166666664 | 4 |
| 45010.489583333336 | 3.96 |
| 45010.5 | 3.82 |
| 45010.510416666664 | 3.37 |
| 45010.520833333336 | 3.39 |
| 45010.53125 | 3.02 |
| 45010.541666666664 | 3.04 |
| 45010.552083333336 | 2.97 |
| 45010.5625 | 2.56 |
| 45010.572916666664 | 2.57 |
| 45010.583333333336 | 2.47 |
| 45010.59375 | 2.07 |
| 45010.604166666664 | 3 |
| 45010.614583333336 | 2.76 |
| 45010.625 | 3.06 |
| 45010.635416666664 | 20.93 |
| 45010.645833333336 | 15.7 |
| 45010.65625 | 3.56 |
| 45010.666666666664 | 3.34 |
| 45010.677083333336 | 3.83 |
| 45010.6875 | 2.34 |
| 45010.697916666664 | 2.65 |
| 45010.708333333336 | 2.58 |
| 45010.71875 | 2.47 |
| 45010.729166666664 | 2.48 |
| 45010.739583333336 | 2.62 |
| 45010.75 | 2.56 |
| 45010.760416666664 | 2.65 |
| 45010.770833333336 | 2.76 |
| 45010.78125 | 3.02 |
| 45010.791666666664 | 554.12 |
| 45010.802083333336 | 577.56 |
| 45010.8125 | 4.4 |
| 45010.822916666664 | 5.5 |
| 45010.833333333336 | 4.36 |
| 45010.84375 | 4.99 |
| 45010.854166666664 | 78.24 |
| 45010.864583333336 | 6.04 |
| 45010.875 | 18.51 |
| 45010.885416666664 | 5.3 |
| 45010.895833333336 | 11.88 |
| 45010.90625 | 33.38 |
| 45010.916666666664 | 6.44 |
| 45010.927083333336 | 4.63 |
| 45010.9375 | 4.73 |
| 45010.947916666664 | 4.52 |
| 45010.958333333336 | 4.29 |
| 45010.96875 | 4.53 |
| 45010.979166666664 | 3.94 |
| 45010.989583333336 | 4.12 |
| 45011.0 | 3.48 |
| 45011.010416666664 | 3.34 |
| 45011.020833333336 | 3.61 |
| 45011.03125 | 3.35 |
| 45011.041666666664 | 3.05 |
| 45011.052083333336 | 2.93 |
| 45011.0625 | 2.9 |
| 45011.072916666664 | 2.8 |
| 45011.083333333336 | 3.97 |
| 45011.09375 | 4.15 |
| 45011.104166666664 | 4.15 |
| 45011.114583333336 | 4.05 |
| 45011.125 | 3.96 |
| 45011.135416666664 | 8.52 |
| 45011.145833333336 | 6 |
| 45011.15625 | 4.02 |
| 45011.166666666664 | 4.31 |
| 45011.177083333336 | 4.35 |
| 45011.1875 | 4.39 |
| 45011.197916666664 | 4.48 |
| 45011.208333333336 | 3.68 |
| 45011.21875 | 3.69 |
| 45011.229166666664 | 3.9 |
| 45011.239583333336 | 3.72 |
| 45011.25 | 7.41 |
| 45011.260416666664 | 8.68 |
| 45011.270833333336 | 13.38 |
| 45011.28125 | 6.45 |
| 45011.291666666664 | 4.83 |
| 45011.302083333336 | 7.56 |
| 45011.3125 | 19.53 |
| 45011.322916666664 | 5.21 |
| 45011.333333333336 | 4.57 |
| 45011.34375 | 8.36 |
| 45011.354166666664 | 5.38 |
| 45011.364583333336 | 5.67 |
| 45011.375 | 3.61 |
| 45011.385416666664 | 24.85 |
| 45011.395833333336 | 5.09 |
| 45011.40625 | 7.46 |
| 45011.416666666664 | 6.55 |
| 45011.427083333336 | 4.77 |
| 45011.4375 | 6.89 |
| 45011.447916666664 | 6.76 |
| 45011.458333333336 | 20.82 |
| 45011.46875 | 6.53 |
| 45011.479166666664 | 4.78 |
| 45011.489583333336 | 4.22 |
| 45011.5 | 4 |
| 45011.510416666664 | 4.38 |
| 45011.520833333336 | 3.55 |
| 45011.53125 | 3.85 |
| 45011.541666666664 | 3.31 |
| 45011.552083333336 | 3.28 |
| 45011.5625 | 3.14 |
| 45011.572916666664 | 2.75 |
| 45011.583333333336 | 2.76 |
| 45011.59375 | 2.57 |
| 45011.604166666664 | 2.71 |
| 45011.614583333336 | 2.84 |
| 45011.625 | 2.22 |
| 45011.635416666664 | 2.15 |
| 45011.645833333336 | 3.23 |
| 45011.65625 | 2.34 |
| 45011.666666666664 | 2.68 |
| 45011.677083333336 | 2.43 |
| 45011.6875 | 2.4 |
| 45011.697916666664 | 2.41 |
| 45011.708333333336 | 2.3 |
| 45011.71875 | 2.38 |
| 45011.729166666664 | 2.21 |
| 45011.739583333336 | 2.37 |
| 45011.75 | 3.12 |
| 45011.760416666664 | 2.98 |
| 45011.770833333336 | 3 |
| 45011.78125 | 5.94 |
| 45011.791666666664 | 5.27 |
| 45011.802083333336 | 5.12 |
| 45011.8125 | 5.77 |
| 45011.822916666664 | 6.04 |
| 45011.833333333336 | 5.35 |
| 45011.84375 | 4.8 |
| 45011.854166666664 | 5 |
| 45011.864583333336 | 5.43 |
| 45011.875 | 4.31 |
| 45011.885416666664 | 4.29 |
| 45011.895833333336 | 4.68 |
| 45011.90625 | 4.75 |
| 45011.916666666664 | 5.47 |
| 45011.927083333336 | 4.31 |
| 45011.9375 | 4.83 |
| 45011.947916666664 | 4.9 |
| 45011.958333333336 | 5.23 |
| 45011.96875 | 4.8 |
| 45011.979166666664 | 5.65 |
| 45011.989583333336 | 5.82 |
| 45012.0 | 5.25 |
| 45012.010416666664 | 4.85 |
| 45012.020833333336 | 4 |
| 45012.03125 | 3.92 |
| 45012.041666666664 | 3.5 |
| 45012.052083333336 | 3.1 |
| 45012.0625 | 3.04 |
| 45012.072916666664 | 3.48 |
| 45012.083333333336 | 2.5 |
| 45012.09375 | 2.76 |
| 45012.104166666664 | 2.75 |
| 45012.114583333336 | 2.86 |
| 45012.125 | 2.57 |
| 45012.135416666664 | 2.58 |
| 45012.145833333336 | 2.4 |
| 45012.15625 | 2.73 |
| 45012.166666666664 | 2.23 |
| 45012.177083333336 | 2.61 |
| 45012.1875 | 2.74 |
| 45012.197916666664 | 2.96 |
| 45012.208333333336 | 2.33 |
| 45012.21875 | 2.39 |
| 45012.229166666664 | 2.71 |
| 45012.239583333336 | 2.51 |
| 45012.25 | 2.19 |
| 45012.260416666664 | 2.48 |
| 45012.270833333336 | 2.04 |
| 45012.28125 | 2.51 |
| 45012.291666666664 | 2.27 |
| 45012.302083333336 | 2.24 |
| 45012.3125 | 2.09 |
| 45012.322916666664 | 2.13 |
| 45012.333333333336 | 2.35 |
| 45012.34375 | 2.09 |
| 45012.354166666664 | 2.16 |
| 45012.364583333336 | 2.69 |
| 45012.375 | 2.34 |
| 45012.385416666664 | 2.6 |
| 45012.395833333336 | 2.6 |
| 45012.40625 | 2.63 |
| 45012.416666666664 | 2.76 |
| 45012.427083333336 | 2.83 |
| 45012.4375 | 2.82 |
| 45012.447916666664 | 2.58 |
| 45012.458333333336 | 2.51 |
| 45012.46875 | 2.57 |
| 45012.479166666664 | 2.74 |
| 45012.489583333336 | 2.8 |
| 45012.5 | 3.03 |
| 45012.510416666664 | 2.86 |
| 45012.520833333336 | 3 |
| 45012.53125 | 3 |
| 45012.541666666664 | 2.67 |
| 45012.552083333336 | 2.44 |
| 45012.5625 | 2.49 |
| 45012.572916666664 | 2.13 |
| 45012.583333333336 | 2.17 |
| 45012.59375 | 2.28 |
| 45012.604166666664 | 2.33 |
| 45012.614583333336 | 2.3 |
| 45012.625 | 2.15 |
| 45012.635416666664 | 2.1 |
| 45012.645833333336 | 2.16 |
| 45012.65625 | 2.2 |
| 45012.666666666664 | 2.04 |
| 45012.677083333336 | 2.02 |
| 45012.6875 | 1.93 |
| 45012.697916666664 | 2.02 |
| 45012.708333333336 | 2.05 |
| 45012.71875 | 2 |
| 45012.729166666664 | 1.96 |
| 45012.739583333336 | 2.14 |
| 45012.75 | 2.08 |
| 45012.760416666664 | 2.11 |
| 45012.770833333336 | 2.21 |
| 45012.78125 | 2.08 |
| 45012.791666666664 | 2.44 |
| 45012.802083333336 | 2.25 |
| 45012.8125 | 2.2 |
| 45012.822916666664 | 2.42 |
| 45012.833333333336 | 2.31 |
| 45012.84375 | 1.61 |
| 45012.854166666664 | 1.37 |
| 45012.864583333336 | 2.01 |
| 45012.875 | 2.21 |
| 45012.885416666664 | 2.12 |
| 45012.895833333336 | 2.46 |
| 45012.90625 | 2.87 |
| 45012.916666666664 | 2.81 |
| 45012.927083333336 | 2.53 |
| 45012.9375 | 2.96 |
| 45012.947916666664 | 2.89 |
| 45012.958333333336 | 3.37 |
| 45012.96875 | 3.23 |
| 45012.979166666664 | 4.87 |
| 45012.989583333336 | 4.95 |
| 45013.0 | 4.86 |
| 45013.010416666664 | 4.95 |
| 45013.020833333336 | 4.63 |
| 45013.03125 | 4.02 |
| 45013.041666666664 | 3.05 |
| 45013.052083333336 | 3.16 |
| 45013.0625 | 3.2 |
| 45013.072916666664 | 2.83 |
| 45013.083333333336 | 2.56 |
| 45013.09375 | 2.22 |
| 45013.104166666664 | 2.28 |
| 45013.114583333336 | 2.09 |
| 45013.125 | 2.27 |
| 45013.135416666664 | 1.8 |
| 45013.145833333336 | 1.99 |
| 45013.15625 | 1.67 |
| 45013.166666666664 | 1.66 |
| 45013.177083333336 | 1.6 |
| 45013.1875 | 1.78 |
| 45013.197916666664 | 1.52 |
| 45013.208333333336 | 1.59 |
| 45013.21875 | 1.52 |
| 45013.229166666664 | 1.43 |
| 45013.239583333336 | 1.59 |
| 45013.25 | 1.69 |
| 45013.260416666664 | 1.59 |
| 45013.270833333336 | 1.77 |
| 45013.28125 | 1.78 |
| 45013.291666666664 | 1.89 |
| 45013.302083333336 | 1.88 |
| 45013.3125 | 1.5 |
| 45013.322916666664 | 1.53 |
| 45013.333333333336 | 1.68 |
| 45013.34375 | 1.6 |
| 45013.354166666664 | 1.36 |
| 45013.364583333336 | 1.62 |
| 45013.375 | 1.38 |
| 45013.385416666664 | 1.56 |
| 45013.395833333336 | 1.5 |
| 45013.40625 | 1.53 |
| 45013.416666666664 | 1.58 |
| 45013.427083333336 | 1.48 |
| 45013.4375 | 1.55 |
| 45013.447916666664 | 1.55 |
| 45013.458333333336 | 1.56 |
| 45013.46875 | 1.61 |
| 45013.479166666664 | 1.51 |
| 45013.489583333336 | 1.58 |
| 45013.5 | 1.71 |
| 45013.510416666664 | 1.91 |
| 45013.520833333336 | 1.93 |
| 45013.53125 | 1.76 |
| 45013.541666666664 | 2.84 |
| 45013.552083333336 | 1.51 |
| 45013.5625 | 1.63 |
| 45013.572916666664 | 1.72 |
| 45013.583333333336 | 1.64 |
| 45013.59375 | 1.23 |
| 45013.604166666664 | 1.37 |
| 45013.614583333336 | 1.12 |
| 45013.625 | 1.25 |
| 45013.635416666664 | 0.76 |
| 45013.645833333336 | 0.69 |
| 45013.65625 | 0.8 |
| 45013.666666666664 | 1.19 |
| 45013.677083333336 | 0.95 |
| 45013.6875 | 0.88 |
| 45013.697916666664 | 0.54 |
| 45013.708333333336 | 0.72 |
| 45013.71875 | 0.79 |
| 45013.729166666664 | 0.64 |
| 45013.739583333336 | 0.82 |
| 45013.75 | 0.85 |
| 45013.760416666664 | 1.02 |
| 45013.770833333336 | 0.98 |
| 45013.78125 | 0.9 |
| 45013.791666666664 | 0.85 |
| 45013.802083333336 | 0.97 |
| 45013.8125 | 1.13 |
| 45013.822916666664 | 1.18 |
| 45013.833333333336 | 1.33 |
| 45013.84375 | 1.23 |
| 45013.854166666664 | 1.33 |
| 45013.864583333336 | 1.38 |
| 45013.875 | 1.35 |
| 45013.885416666664 | 1.51 |
| 45013.895833333336 | 1.66 |
| 45013.90625 | 2.07 |
| 45013.916666666664 | 1.94 |
| 45013.927083333336 | 1.95 |
| 45013.9375 | 2.34 |
| 45013.947916666664 | 2.65 |
| 45013.958333333336 | 2.56 |
| 45013.96875 | 2.61 |
| 45013.979166666664 | 2.69 |
| 45013.989583333336 | 3.05 |
| 45014.0 | 3.11 |
| 45014.010416666664 | 3.08 |
| 45014.020833333336 | 3.51 |
| 45014.03125 | 3.57 |
| 45014.041666666664 | 3.54 |
| 45014.052083333336 | 3.48 |
| 45014.0625 | 3.59 |
| 45014.072916666664 | 3.32 |
| 45014.083333333336 | 3.03 |
| 45014.09375 | 2.99 |
| 45014.104166666664 | 2.99 |
| 45014.114583333336 | 2.61 |
| 45014.125 | 2.29 |
| 45014.135416666664 | 2.19 |
| 45014.145833333336 | 2.2 |
| 45014.15625 | 1.82 |
| 45014.166666666664 | 1.84 |
| 45014.177083333336 | 1.77 |
| 45014.1875 | 1.47 |
| 45014.197916666664 | 1.52 |
| 45014.208333333336 | 1.73 |
| 45014.21875 | 1.56 |
| 45014.229166666664 | 1.47 |
| 45014.239583333336 | 1.49 |
| 45014.25 | 2.04 |
| 45014.260416666664 | 53.61 |
| 45014.270833333336 | 1.23 |
| 45014.28125 | 1.34 |
| 45014.291666666664 | 1.41 |
| 45014.302083333336 | 1.37 |
| 45014.3125 | 1.57 |
| 45014.322916666664 | 1.23 |
| 45014.333333333336 | 1.31 |
| 45014.34375 | 1.39 |
| 45014.354166666664 | 1.42 |
| 45014.364583333336 | 1.19 |
| 45014.375 | 1.33 |
| 45014.385416666664 | 1.58 |
| 45014.395833333336 | 1.34 |
| 45014.40625 | 1.43 |
| 45014.416666666664 | 1.22 |
| 45014.427083333336 | 1.62 |
| 45014.4375 | 1.55 |
| 45014.447916666664 | 1.52 |
| 45014.458333333336 | 1.35 |
| 45014.46875 | 1.22 |
| 45014.479166666664 | 1.21 |
| 45014.489583333336 | 1.34 |
| 45014.5 | 1.53 |
| 45014.510416666664 | 1.58 |
| 45014.520833333336 | 1.35 |
| 45014.53125 | 1.32 |
| 45014.541666666664 | 1.09 |
| 45014.552083333336 | 1.12 |
| 45014.5625 | 1.23 |
| 45014.572916666664 | 1.23 |
| 45014.583333333336 | 1.03 |
| 45014.59375 | 0.92 |
| 45014.604166666664 | 1.05 |
| 45014.614583333336 | 0.93 |
| 45014.625 | 0.59 |
| 45014.635416666664 | 0.84 |
| 45014.645833333336 | 0.95 |
| 45014.65625 | 1 |
| 45014.666666666664 | 0.67 |
| 45014.677083333336 | 0.55 |
| 45014.6875 | 0.57 |
| 45014.697916666664 | 0.45 |
| 45014.708333333336 | 0.6 |
| 45014.71875 | 0.76 |
| 45014.729166666664 | 0.57 |
| 45014.739583333336 | 0.74 |
| 45014.75 | 0.55 |
| 45014.760416666664 | 0.69 |
| 45014.770833333336 | 0.64 |
| 45014.78125 | 0.62 |
| 45014.791666666664 | 0.79 |
| 45014.802083333336 | 0.72 |
| 45014.8125 | 0.92 |
| 45014.822916666664 | 0.86 |
| 45014.833333333336 | 0.81 |
| 45014.84375 | 0.85 |
| 45014.854166666664 | 0.86 |
| 45014.864583333336 | 0.83 |
| 45014.875 | 1.04 |
| 45014.885416666664 | 1.11 |
| 45014.895833333336 | 1.2 |
| 45014.90625 | 1.22 |
| 45014.916666666664 | 1.32 |
| 45014.927083333336 | 1.32 |
| 45014.9375 | 1.48 |
| 45014.947916666664 | 1.57 |
| 45014.958333333336 | 1.53 |
| 45014.96875 | 1.78 |
| 45014.979166666664 | 2.1 |
| 45014.989583333336 | 2.37 |
| 45015.0 | 2.42 |
| 45015.010416666664 | 2.59 |
| 45015.020833333336 | 2.59 |
| 45015.03125 | 2.81 |
| 45015.041666666664 | 3.19 |
| 45015.052083333336 | 3.13 |
| 45015.0625 | 2.72 |
| 45015.072916666664 | 2.7 |
| 45015.083333333336 | 2.68 |
| 45015.09375 | 2.62 |
| 45015.104166666664 | 2.46 |
| 45015.114583333336 | 2.05 |
| 45015.125 | 1.93 |
| 45015.135416666664 | 1.89 |
| 45015.145833333336 | 1.65 |
| 45015.15625 | 1.48 |
| 45015.166666666664 | 1.47 |
| 45015.177083333336 | 1.43 |
| 45015.1875 | 1.6 |
| 45015.197916666664 | 1.65 |
| 45015.208333333336 | 1.94 |
| 45015.21875 | 3.62 |
| 45015.229166666664 | 20.73 |
| 45015.239583333336 | 218.34 |
| 45015.25 | 32.85 |
| 45015.260416666664 | 5.45 |
| 45015.270833333336 | 53.44 |
| 45015.28125 | 20.89 |
| 45015.291666666664 | 25.68 |
| 45015.302083333336 | 13.73 |
| 45015.3125 | 6.74 |
| 45015.322916666664 | 2.25 |
| 45015.333333333336 | 3.5 |
| 45015.34375 | 3.57 |
| 45015.354166666664 | 1.39 |
| 45015.364583333336 | 2.07 |
| 45015.375 | 0.74 |
| 45015.385416666664 | 0.92 |
| 45015.395833333336 | 0.93 |
| 45015.40625 | 1.11 |
| 45015.416666666664 | 1.04 |
| 45015.427083333336 | 0.96 |
| 45015.4375 | 0.92 |
| 45015.447916666664 | 1.28 |
| 45015.458333333336 | 0.96 |
| 45015.46875 | 0.87 |
| 45015.479166666664 | 0.96 |
| 45015.489583333336 | 0.94 |
| 45015.5 | 1.06 |
| 45015.510416666664 | 1.4 |
| 45015.520833333336 | 1.31 |
| 45015.53125 | 1.25 |
| 45015.541666666664 | 1.09 |
| 45015.552083333336 | 1.1 |
| 45015.5625 | 1.27 |
| 45015.572916666664 | 1.23 |
| 45015.583333333336 | 1.19 |
| 45015.59375 | 1.21 |
| 45015.604166666664 | 1.37 |
| 45015.614583333336 | 1.5 |
| 45015.625 | 1 |
| 45015.635416666664 | 1.02 |
| 45015.645833333336 | 0.95 |
| 45015.65625 | 0.8 |
| 45015.666666666664 | 0.64 |
| 45015.677083333336 | 0.78 |
| 45015.6875 | 0.93 |
| 45015.697916666664 | 0.72 |
| 45015.708333333336 | 0.47 |
| 45015.71875 | 0.68 |
| 45015.729166666664 | 0.63 |
| 45015.739583333336 | 0.6 |
| 45015.75 | 0.59 |
| 45015.760416666664 | 0.42 |
| 45015.770833333336 | 0.66 |
| 45015.78125 | 0.8 |
| 45015.791666666664 | 0.88 |
| 45015.802083333336 | 0.73 |
| 45015.8125 | 0.79 |
| 45015.822916666664 | 0.88 |
| 45015.833333333336 | 0.85 |
| 45015.84375 | 0.9 |
| 45015.854166666664 | 0.82 |
| 45015.864583333336 | 1.01 |
| 45015.875 | 0.95 |
| 45015.885416666664 | 1.18 |
| 45015.895833333336 | 1.51 |
| 45015.90625 | 1.45 |
| 45015.916666666664 | 1.28 |
| 45015.927083333336 | 1.56 |
| 45015.9375 | 1.57 |
| 45015.947916666664 | 1.53 |
| 45015.958333333336 | 1.54 |
| 45015.96875 | 1.45 |
| 45015.979166666664 | 1.77 |
| 45015.989583333336 | 1.9 |
| 45016.0 | 2.08 |
| 45016.010416666664 | 2.35 |
| 45016.020833333336 | 2.53 |
| 45016.03125 | 2.49 |
| 45016.041666666664 | 2.65 |
| 45016.052083333336 | 2.73 |
| 45016.0625 | 2.86 |
| 45016.072916666664 | 3.07 |
| 45016.083333333336 | 3.08 |
| 45016.09375 | 3.67 |
| 45016.104166666664 | 3.45 |
| 45016.114583333336 | 4.14 |
| 45016.125 | 4.35 |
| 45016.135416666664 | 3.44 |
| 45016.145833333336 | 3.35 |
| 45016.15625 | 2.87 |
| 45016.166666666664 | 3.12 |
| 45016.177083333336 | 2.35 |
| 45016.1875 | 2.32 |
| 45016.197916666664 | 1.99 |
| 45016.208333333336 | 1.88 |
| 45016.21875 | 1.79 |
| 45016.229166666664 | 1.7 |
| 45016.239583333336 | 1.98 |
| 45016.25 | 1.92 |
| 45016.260416666664 | 1.88 |
| 45016.270833333336 | 1.95 |
| 45016.28125 | 1.62 |
| 45016.291666666664 | 1.2 |
| 45016.302083333336 | 1.32 |
| 45016.3125 | 1.26 |
| 45016.322916666664 | 1.31 |
| 45016.333333333336 | 0.92 |
| 45016.34375 | 0.95 |
| 45016.354166666664 | 0.76 |
| 45016.364583333336 | 0.89 |
| 45016.375 | 0.89 |
| 45016.385416666664 | 0.67 |
| 45016.395833333336 | 0.85 |
| 45016.40625 | 0.85 |
| 45016.416666666664 | 0.92 |
| 45016.427083333336 | 0.85 |
| 45016.4375 | 0.78 |
| 45016.447916666664 | 0.77 |
| 45016.458333333336 | 0.76 |
| 45016.46875 | 0.83 |
| 45016.479166666664 | 0.79 |
| 45016.489583333336 | 0.88 |
| 45016.5 | 0.94 |
| 45016.510416666664 | 0.93 |
| 45016.520833333336 | 1.09 |
| 45016.53125 | 0.7 |
| 45016.541666666664 | 0.86 |
| 45016.552083333336 | 1.16 |
| 45016.5625 | 0.84 |
| 45016.572916666664 | 0.87 |
| 45016.583333333336 | 1.1 |
| 45016.59375 | 1.16 |
| 45016.604166666664 | 1.01 |
| 45016.614583333336 | 1.03 |
| 45016.625 | 1.02 |
| 45016.635416666664 | 1.2 |
| 45016.645833333336 | 1.57 |
| 45016.65625 | 1.33 |
| 45016.666666666664 | 1.27 |
| 45016.677083333336 | 1.49 |
| 45016.6875 | 1.53 |
| 45016.697916666664 | 1.68 |
| 45016.708333333336 | 1.57 |
| 45016.71875 | 1.15 |
| 45016.729166666664 | 2.49 |
| 45016.739583333336 | 0.75 |
| 45016.75 | 0.8 |
| 45016.760416666664 | 0.7 |
| 45016.770833333336 | 0.92 |
| 45016.78125 | 0.88 |
| 45016.791666666664 | 1.04 |
| 45016.802083333336 | 0.98 |
| 45016.8125 | 1.13 |
| 45016.822916666664 | 0.91 |
| 45016.833333333336 | 0.77 |
| 45016.84375 | 0.89 |
| 45016.854166666664 | 0.8 |
| 45016.864583333336 | 1.01 |
| 45016.875 | 0.91 |
| 45016.885416666664 | 0.82 |
| 45016.895833333336 | 0.97 |
| 45016.90625 | 0.89 |
| 45016.916666666664 | 1.15 |
| 45016.927083333336 | 0.76 |
| 45016.9375 | 0.85 |
| 45016.947916666664 | 1.04 |
| 45016.958333333336 | 1.31 |
| 45016.96875 | 1.19 |
| 45016.979166666664 | 1.46 |
| 45016.989583333336 | 1.56 |
| 45017.0 | 1.4 |
| 45017.010416666664 | 1.31 |
| 45017.020833333336 | 1.15 |
| 45017.03125 | 1.48 |
| 45017.041666666664 | 1.27 |
| 45017.052083333336 | 1.87 |
| 45017.0625 | 2.34 |
| 45017.072916666664 | 2.79 |
| 45017.083333333336 | 3.14 |
| 45017.09375 | 3.21 |
| 45017.104166666664 | 3.38 |
| 45017.114583333336 | 3.75 |
| 45017.125 | 3.96 |
| 45017.135416666664 | 3.73 |
| 45017.145833333336 | 3.54 |